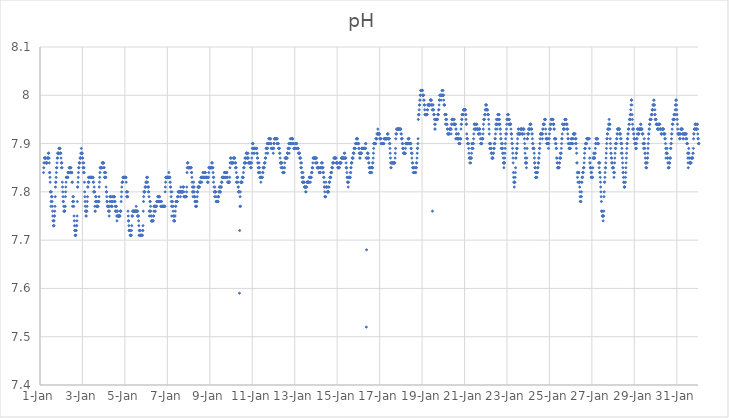
| Category | pH |
|---|---|
| 44927.166666666664 | 7.84 |
| 44927.177083333336 | 7.85 |
| 44927.1875 | 7.86 |
| 44927.197916666664 | 7.86 |
| 44927.208333333336 | 7.87 |
| 44927.21875 | 7.87 |
| 44927.229166666664 | 7.87 |
| 44927.239583333336 | 7.87 |
| 44927.25 | 7.87 |
| 44927.260416666664 | 7.87 |
| 44927.270833333336 | 7.87 |
| 44927.28125 | 7.86 |
| 44927.291666666664 | 7.86 |
| 44927.302083333336 | 7.86 |
| 44927.3125 | 7.86 |
| 44927.322916666664 | 7.86 |
| 44927.333333333336 | 7.86 |
| 44927.34375 | 7.87 |
| 44927.354166666664 | 7.87 |
| 44927.364583333336 | 7.87 |
| 44927.375 | 7.87 |
| 44927.385416666664 | 7.87 |
| 44927.395833333336 | 7.88 |
| 44927.40625 | 7.88 |
| 44927.416666666664 | 7.87 |
| 44927.427083333336 | 7.87 |
| 44927.4375 | 7.86 |
| 44927.447916666664 | 7.84 |
| 44927.458333333336 | 7.84 |
| 44927.46875 | 7.83 |
| 44927.479166666664 | 7.82 |
| 44927.489583333336 | 7.8 |
| 44927.5 | 7.8 |
| 44927.510416666664 | 7.77 |
| 44927.520833333336 | 7.78 |
| 44927.53125 | 7.8 |
| 44927.541666666664 | 7.79 |
| 44927.552083333336 | 7.79 |
| 44927.5625 | 7.79 |
| 44927.572916666664 | 7.78 |
| 44927.583333333336 | 7.77 |
| 44927.59375 | 7.76 |
| 44927.604166666664 | 7.75 |
| 44927.614583333336 | 7.74 |
| 44927.625 | 7.74 |
| 44927.635416666664 | 7.73 |
| 44927.645833333336 | 7.73 |
| 44927.65625 | 7.73 |
| 44927.666666666664 | 7.74 |
| 44927.677083333336 | 7.75 |
| 44927.6875 | 7.75 |
| 44927.697916666664 | 7.76 |
| 44927.708333333336 | 7.77 |
| 44927.71875 | 7.79 |
| 44927.729166666664 | 7.81 |
| 44927.739583333336 | 7.82 |
| 44927.75 | 7.82 |
| 44927.760416666664 | 7.83 |
| 44927.770833333336 | 7.84 |
| 44927.78125 | 7.85 |
| 44927.791666666664 | 7.85 |
| 44927.802083333336 | 7.86 |
| 44927.8125 | 7.87 |
| 44927.822916666664 | 7.87 |
| 44927.833333333336 | 7.88 |
| 44927.84375 | 7.88 |
| 44927.854166666664 | 7.88 |
| 44927.864583333336 | 7.88 |
| 44927.875 | 7.88 |
| 44927.885416666664 | 7.88 |
| 44927.895833333336 | 7.89 |
| 44927.90625 | 7.89 |
| 44927.916666666664 | 7.89 |
| 44927.927083333336 | 7.89 |
| 44927.9375 | 7.88 |
| 44927.947916666664 | 7.89 |
| 44927.958333333336 | 7.88 |
| 44927.96875 | 7.88 |
| 44927.979166666664 | 7.88 |
| 44927.989583333336 | 7.87 |
| 44928.0 | 7.86 |
| 44928.010416666664 | 7.85 |
| 44928.020833333336 | 7.86 |
| 44928.03125 | 7.86 |
| 44928.041666666664 | 7.85 |
| 44928.052083333336 | 7.82 |
| 44928.0625 | 7.81 |
| 44928.072916666664 | 7.8 |
| 44928.083333333336 | 7.79 |
| 44928.09375 | 7.78 |
| 44928.104166666664 | 7.78 |
| 44928.114583333336 | 7.77 |
| 44928.125 | 7.76 |
| 44928.135416666664 | 7.76 |
| 44928.145833333336 | 7.76 |
| 44928.15625 | 7.76 |
| 44928.166666666664 | 7.76 |
| 44928.177083333336 | 7.77 |
| 44928.1875 | 7.77 |
| 44928.197916666664 | 7.79 |
| 44928.208333333336 | 7.8 |
| 44928.21875 | 7.81 |
| 44928.229166666664 | 7.82 |
| 44928.239583333336 | 7.83 |
| 44928.25 | 7.83 |
| 44928.260416666664 | 7.83 |
| 44928.270833333336 | 7.83 |
| 44928.28125 | 7.83 |
| 44928.291666666664 | 7.83 |
| 44928.302083333336 | 7.83 |
| 44928.3125 | 7.83 |
| 44928.322916666664 | 7.84 |
| 44928.333333333336 | 7.84 |
| 44928.34375 | 7.84 |
| 44928.354166666664 | 7.84 |
| 44928.364583333336 | 7.84 |
| 44928.375 | 7.85 |
| 44928.385416666664 | 7.85 |
| 44928.395833333336 | 7.85 |
| 44928.40625 | 7.85 |
| 44928.416666666664 | 7.85 |
| 44928.427083333336 | 7.85 |
| 44928.4375 | 7.85 |
| 44928.447916666664 | 7.84 |
| 44928.458333333336 | 7.85 |
| 44928.46875 | 7.84 |
| 44928.479166666664 | 7.84 |
| 44928.489583333336 | 7.84 |
| 44928.5 | 7.84 |
| 44928.510416666664 | 7.82 |
| 44928.520833333336 | 7.82 |
| 44928.53125 | 7.77 |
| 44928.541666666664 | 7.78 |
| 44928.552083333336 | 7.79 |
| 44928.5625 | 7.78 |
| 44928.572916666664 | 7.79 |
| 44928.583333333336 | 7.78 |
| 44928.59375 | 7.77 |
| 44928.604166666664 | 7.75 |
| 44928.614583333336 | 7.74 |
| 44928.625 | 7.73 |
| 44928.635416666664 | 7.72 |
| 44928.645833333336 | 7.72 |
| 44928.65625 | 7.71 |
| 44928.666666666664 | 7.71 |
| 44928.677083333336 | 7.71 |
| 44928.6875 | 7.71 |
| 44928.697916666664 | 7.72 |
| 44928.708333333336 | 7.72 |
| 44928.71875 | 7.73 |
| 44928.729166666664 | 7.73 |
| 44928.739583333336 | 7.74 |
| 44928.75 | 7.75 |
| 44928.760416666664 | 7.78 |
| 44928.770833333336 | 7.81 |
| 44928.78125 | 7.81 |
| 44928.791666666664 | 7.82 |
| 44928.802083333336 | 7.83 |
| 44928.8125 | 7.84 |
| 44928.822916666664 | 7.85 |
| 44928.833333333336 | 7.85 |
| 44928.84375 | 7.86 |
| 44928.854166666664 | 7.86 |
| 44928.864583333336 | 7.86 |
| 44928.875 | 7.86 |
| 44928.885416666664 | 7.87 |
| 44928.895833333336 | 7.87 |
| 44928.90625 | 7.87 |
| 44928.916666666664 | 7.87 |
| 44928.927083333336 | 7.88 |
| 44928.9375 | 7.88 |
| 44928.947916666664 | 7.89 |
| 44928.958333333336 | 7.88 |
| 44928.96875 | 7.88 |
| 44928.979166666664 | 7.88 |
| 44928.989583333336 | 7.88 |
| 44929.0 | 7.87 |
| 44929.010416666664 | 7.87 |
| 44929.020833333336 | 7.86 |
| 44929.03125 | 7.85 |
| 44929.041666666664 | 7.85 |
| 44929.052083333336 | 7.84 |
| 44929.0625 | 7.86 |
| 44929.072916666664 | 7.85 |
| 44929.083333333336 | 7.84 |
| 44929.09375 | 7.82 |
| 44929.104166666664 | 7.8 |
| 44929.114583333336 | 7.79 |
| 44929.125 | 7.78 |
| 44929.135416666664 | 7.77 |
| 44929.145833333336 | 7.76 |
| 44929.15625 | 7.76 |
| 44929.166666666664 | 7.75 |
| 44929.177083333336 | 7.75 |
| 44929.1875 | 7.76 |
| 44929.197916666664 | 7.76 |
| 44929.208333333336 | 7.76 |
| 44929.21875 | 7.77 |
| 44929.229166666664 | 7.78 |
| 44929.239583333336 | 7.79 |
| 44929.25 | 7.81 |
| 44929.260416666664 | 7.81 |
| 44929.270833333336 | 7.82 |
| 44929.28125 | 7.83 |
| 44929.291666666664 | 7.82 |
| 44929.302083333336 | 7.82 |
| 44929.3125 | 7.83 |
| 44929.322916666664 | 7.83 |
| 44929.333333333336 | 7.83 |
| 44929.34375 | 7.83 |
| 44929.354166666664 | 7.83 |
| 44929.364583333336 | 7.83 |
| 44929.375 | 7.83 |
| 44929.385416666664 | 7.83 |
| 44929.395833333336 | 7.83 |
| 44929.40625 | 7.83 |
| 44929.416666666664 | 7.83 |
| 44929.427083333336 | 7.83 |
| 44929.4375 | 7.83 |
| 44929.447916666664 | 7.83 |
| 44929.458333333336 | 7.83 |
| 44929.46875 | 7.83 |
| 44929.479166666664 | 7.83 |
| 44929.489583333336 | 7.83 |
| 44929.5 | 7.83 |
| 44929.510416666664 | 7.82 |
| 44929.520833333336 | 7.82 |
| 44929.53125 | 7.8 |
| 44929.541666666664 | 7.8 |
| 44929.552083333336 | 7.81 |
| 44929.5625 | 7.8 |
| 44929.572916666664 | 7.8 |
| 44929.583333333336 | 7.77 |
| 44929.59375 | 7.76 |
| 44929.604166666664 | 7.76 |
| 44929.614583333336 | 7.78 |
| 44929.625 | 7.79 |
| 44929.635416666664 | 7.79 |
| 44929.645833333336 | 7.78 |
| 44929.65625 | 7.78 |
| 44929.666666666664 | 7.77 |
| 44929.677083333336 | 7.77 |
| 44929.6875 | 7.77 |
| 44929.697916666664 | 7.77 |
| 44929.708333333336 | 7.77 |
| 44929.71875 | 7.77 |
| 44929.729166666664 | 7.77 |
| 44929.739583333336 | 7.78 |
| 44929.75 | 7.78 |
| 44929.760416666664 | 7.78 |
| 44929.770833333336 | 7.78 |
| 44929.78125 | 7.79 |
| 44929.791666666664 | 7.81 |
| 44929.802083333336 | 7.82 |
| 44929.8125 | 7.83 |
| 44929.822916666664 | 7.84 |
| 44929.833333333336 | 7.85 |
| 44929.84375 | 7.85 |
| 44929.854166666664 | 7.85 |
| 44929.864583333336 | 7.85 |
| 44929.875 | 7.85 |
| 44929.885416666664 | 7.85 |
| 44929.895833333336 | 7.85 |
| 44929.90625 | 7.85 |
| 44929.916666666664 | 7.85 |
| 44929.927083333336 | 7.86 |
| 44929.9375 | 7.86 |
| 44929.947916666664 | 7.86 |
| 44929.958333333336 | 7.86 |
| 44929.96875 | 7.86 |
| 44929.979166666664 | 7.86 |
| 44929.989583333336 | 7.86 |
| 44930.0 | 7.86 |
| 44930.010416666664 | 7.85 |
| 44930.020833333336 | 7.85 |
| 44930.03125 | 7.84 |
| 44930.041666666664 | 7.83 |
| 44930.052083333336 | 7.83 |
| 44930.0625 | 7.84 |
| 44930.072916666664 | 7.83 |
| 44930.083333333336 | 7.83 |
| 44930.09375 | 7.84 |
| 44930.104166666664 | 7.83 |
| 44930.114583333336 | 7.81 |
| 44930.125 | 7.8 |
| 44930.135416666664 | 7.8 |
| 44930.145833333336 | 7.79 |
| 44930.15625 | 7.78 |
| 44930.166666666664 | 7.78 |
| 44930.177083333336 | 7.77 |
| 44930.1875 | 7.77 |
| 44930.197916666664 | 7.77 |
| 44930.208333333336 | 7.77 |
| 44930.21875 | 7.77 |
| 44930.229166666664 | 7.76 |
| 44930.239583333336 | 7.76 |
| 44930.25 | 7.76 |
| 44930.260416666664 | 7.75 |
| 44930.270833333336 | 7.76 |
| 44930.28125 | 7.77 |
| 44930.291666666664 | 7.78 |
| 44930.302083333336 | 7.79 |
| 44930.3125 | 7.79 |
| 44930.322916666664 | 7.79 |
| 44930.333333333336 | 7.79 |
| 44930.34375 | 7.79 |
| 44930.354166666664 | 7.78 |
| 44930.364583333336 | 7.77 |
| 44930.375 | 7.77 |
| 44930.385416666664 | 7.77 |
| 44930.395833333336 | 7.77 |
| 44930.40625 | 7.78 |
| 44930.416666666664 | 7.78 |
| 44930.427083333336 | 7.78 |
| 44930.4375 | 7.79 |
| 44930.447916666664 | 7.79 |
| 44930.458333333336 | 7.79 |
| 44930.46875 | 7.79 |
| 44930.479166666664 | 7.79 |
| 44930.489583333336 | 7.79 |
| 44930.5 | 7.79 |
| 44930.510416666664 | 7.79 |
| 44930.520833333336 | 7.78 |
| 44930.53125 | 7.78 |
| 44930.541666666664 | 7.77 |
| 44930.552083333336 | 7.76 |
| 44930.5625 | 7.76 |
| 44930.572916666664 | 7.77 |
| 44930.583333333336 | 7.77 |
| 44930.59375 | 7.77 |
| 44930.604166666664 | 7.76 |
| 44930.614583333336 | 7.75 |
| 44930.625 | 7.74 |
| 44930.635416666664 | 7.76 |
| 44930.645833333336 | 7.76 |
| 44930.65625 | 7.75 |
| 44930.666666666664 | 7.75 |
| 44930.677083333336 | 7.75 |
| 44930.6875 | 7.75 |
| 44930.697916666664 | 7.75 |
| 44930.708333333336 | 7.75 |
| 44930.71875 | 7.75 |
| 44930.729166666664 | 7.75 |
| 44930.739583333336 | 7.75 |
| 44930.75 | 7.75 |
| 44930.760416666664 | 7.75 |
| 44930.770833333336 | 7.75 |
| 44930.78125 | 7.76 |
| 44930.791666666664 | 7.76 |
| 44930.802083333336 | 7.76 |
| 44930.8125 | 7.76 |
| 44930.822916666664 | 7.78 |
| 44930.833333333336 | 7.79 |
| 44930.84375 | 7.8 |
| 44930.854166666664 | 7.81 |
| 44930.864583333336 | 7.82 |
| 44930.875 | 7.82 |
| 44930.885416666664 | 7.82 |
| 44930.895833333336 | 7.82 |
| 44930.90625 | 7.83 |
| 44930.916666666664 | 7.83 |
| 44930.927083333336 | 7.83 |
| 44930.9375 | 7.83 |
| 44930.947916666664 | 7.83 |
| 44930.958333333336 | 7.83 |
| 44930.96875 | 7.83 |
| 44930.979166666664 | 7.83 |
| 44930.989583333336 | 7.83 |
| 44931.0 | 7.83 |
| 44931.010416666664 | 7.83 |
| 44931.020833333336 | 7.83 |
| 44931.03125 | 7.83 |
| 44931.041666666664 | 7.83 |
| 44931.052083333336 | 7.83 |
| 44931.0625 | 7.82 |
| 44931.072916666664 | 7.8 |
| 44931.083333333336 | 7.79 |
| 44931.09375 | 7.8 |
| 44931.104166666664 | 7.79 |
| 44931.114583333336 | 7.79 |
| 44931.125 | 7.8 |
| 44931.135416666664 | 7.79 |
| 44931.145833333336 | 7.76 |
| 44931.15625 | 7.75 |
| 44931.166666666664 | 7.74 |
| 44931.177083333336 | 7.74 |
| 44931.1875 | 7.73 |
| 44931.197916666664 | 7.72 |
| 44931.208333333336 | 7.72 |
| 44931.21875 | 7.72 |
| 44931.229166666664 | 7.72 |
| 44931.239583333336 | 7.72 |
| 44931.25 | 7.71 |
| 44931.260416666664 | 7.71 |
| 44931.270833333336 | 7.71 |
| 44931.28125 | 7.71 |
| 44931.291666666664 | 7.71 |
| 44931.302083333336 | 7.71 |
| 44931.3125 | 7.72 |
| 44931.322916666664 | 7.73 |
| 44931.333333333336 | 7.75 |
| 44931.34375 | 7.75 |
| 44931.354166666664 | 7.75 |
| 44931.364583333336 | 7.76 |
| 44931.375 | 7.76 |
| 44931.385416666664 | 7.76 |
| 44931.395833333336 | 7.76 |
| 44931.40625 | 7.76 |
| 44931.416666666664 | 7.76 |
| 44931.427083333336 | 7.76 |
| 44931.4375 | 7.76 |
| 44931.447916666664 | 7.76 |
| 44931.458333333336 | 7.76 |
| 44931.46875 | 7.76 |
| 44931.479166666664 | 7.76 |
| 44931.489583333336 | 7.76 |
| 44931.5 | 7.76 |
| 44931.510416666664 | 7.76 |
| 44931.520833333336 | 7.76 |
| 44931.53125 | 7.77 |
| 44931.541666666664 | 7.76 |
| 44931.552083333336 | 7.76 |
| 44931.5625 | 7.76 |
| 44931.572916666664 | 7.76 |
| 44931.583333333336 | 7.76 |
| 44931.59375 | 7.75 |
| 44931.604166666664 | 7.76 |
| 44931.614583333336 | 7.75 |
| 44931.625 | 7.75 |
| 44931.635416666664 | 7.75 |
| 44931.645833333336 | 7.74 |
| 44931.65625 | 7.73 |
| 44931.666666666664 | 7.71 |
| 44931.677083333336 | 7.72 |
| 44931.6875 | 7.71 |
| 44931.697916666664 | 7.72 |
| 44931.708333333336 | 7.72 |
| 44931.71875 | 7.71 |
| 44931.729166666664 | 7.71 |
| 44931.739583333336 | 7.71 |
| 44931.75 | 7.71 |
| 44931.760416666664 | 7.71 |
| 44931.770833333336 | 7.71 |
| 44931.78125 | 7.71 |
| 44931.791666666664 | 7.71 |
| 44931.802083333336 | 7.71 |
| 44931.8125 | 7.71 |
| 44931.822916666664 | 7.71 |
| 44931.833333333336 | 7.72 |
| 44931.84375 | 7.72 |
| 44931.854166666664 | 7.73 |
| 44931.864583333336 | 7.76 |
| 44931.875 | 7.78 |
| 44931.885416666664 | 7.79 |
| 44931.895833333336 | 7.8 |
| 44931.90625 | 7.8 |
| 44931.916666666664 | 7.8 |
| 44931.927083333336 | 7.8 |
| 44931.9375 | 7.8 |
| 44931.947916666664 | 7.81 |
| 44931.958333333336 | 7.81 |
| 44931.96875 | 7.81 |
| 44931.979166666664 | 7.81 |
| 44931.989583333336 | 7.82 |
| 44932.0 | 7.82 |
| 44932.010416666664 | 7.82 |
| 44932.020833333336 | 7.82 |
| 44932.03125 | 7.83 |
| 44932.041666666664 | 7.83 |
| 44932.052083333336 | 7.83 |
| 44932.0625 | 7.83 |
| 44932.072916666664 | 7.82 |
| 44932.083333333336 | 7.81 |
| 44932.09375 | 7.81 |
| 44932.104166666664 | 7.8 |
| 44932.114583333336 | 7.81 |
| 44932.125 | 7.8 |
| 44932.135416666664 | 7.79 |
| 44932.145833333336 | 7.76 |
| 44932.15625 | 7.75 |
| 44932.166666666664 | 7.76 |
| 44932.177083333336 | 7.78 |
| 44932.1875 | 7.76 |
| 44932.197916666664 | 7.78 |
| 44932.208333333336 | 7.77 |
| 44932.21875 | 7.76 |
| 44932.229166666664 | 7.75 |
| 44932.239583333336 | 7.75 |
| 44932.25 | 7.74 |
| 44932.260416666664 | 7.74 |
| 44932.270833333336 | 7.74 |
| 44932.28125 | 7.74 |
| 44932.291666666664 | 7.74 |
| 44932.302083333336 | 7.74 |
| 44932.3125 | 7.74 |
| 44932.322916666664 | 7.74 |
| 44932.333333333336 | 7.74 |
| 44932.34375 | 7.75 |
| 44932.354166666664 | 7.75 |
| 44932.364583333336 | 7.76 |
| 44932.375 | 7.77 |
| 44932.385416666664 | 7.77 |
| 44932.395833333336 | 7.77 |
| 44932.40625 | 7.77 |
| 44932.416666666664 | 7.76 |
| 44932.427083333336 | 7.76 |
| 44932.4375 | 7.77 |
| 44932.447916666664 | 7.77 |
| 44932.458333333336 | 7.77 |
| 44932.46875 | 7.77 |
| 44932.479166666664 | 7.77 |
| 44932.489583333336 | 7.77 |
| 44932.5 | 7.78 |
| 44932.510416666664 | 7.78 |
| 44932.520833333336 | 7.78 |
| 44932.53125 | 7.78 |
| 44932.541666666664 | 7.78 |
| 44932.552083333336 | 7.79 |
| 44932.5625 | 7.79 |
| 44932.572916666664 | 7.79 |
| 44932.583333333336 | 7.79 |
| 44932.59375 | 7.78 |
| 44932.604166666664 | 7.79 |
| 44932.614583333336 | 7.79 |
| 44932.625 | 7.79 |
| 44932.635416666664 | 7.79 |
| 44932.645833333336 | 7.78 |
| 44932.65625 | 7.78 |
| 44932.666666666664 | 7.78 |
| 44932.677083333336 | 7.78 |
| 44932.6875 | 7.77 |
| 44932.697916666664 | 7.77 |
| 44932.708333333336 | 7.78 |
| 44932.71875 | 7.77 |
| 44932.729166666664 | 7.78 |
| 44932.739583333336 | 7.77 |
| 44932.75 | 7.77 |
| 44932.760416666664 | 7.77 |
| 44932.770833333336 | 7.77 |
| 44932.78125 | 7.77 |
| 44932.791666666664 | 7.77 |
| 44932.802083333336 | 7.77 |
| 44932.8125 | 7.77 |
| 44932.822916666664 | 7.77 |
| 44932.833333333336 | 7.77 |
| 44932.84375 | 7.77 |
| 44932.854166666664 | 7.77 |
| 44932.864583333336 | 7.77 |
| 44932.875 | 7.77 |
| 44932.885416666664 | 7.77 |
| 44932.895833333336 | 7.8 |
| 44932.90625 | 7.81 |
| 44932.916666666664 | 7.82 |
| 44932.927083333336 | 7.83 |
| 44932.9375 | 7.83 |
| 44932.947916666664 | 7.83 |
| 44932.958333333336 | 7.83 |
| 44932.96875 | 7.83 |
| 44932.979166666664 | 7.83 |
| 44932.989583333336 | 7.83 |
| 44933.0 | 7.83 |
| 44933.010416666664 | 7.83 |
| 44933.020833333336 | 7.83 |
| 44933.03125 | 7.83 |
| 44933.041666666664 | 7.83 |
| 44933.052083333336 | 7.83 |
| 44933.0625 | 7.83 |
| 44933.072916666664 | 7.84 |
| 44933.083333333336 | 7.83 |
| 44933.09375 | 7.83 |
| 44933.104166666664 | 7.83 |
| 44933.114583333336 | 7.83 |
| 44933.125 | 7.82 |
| 44933.135416666664 | 7.82 |
| 44933.145833333336 | 7.81 |
| 44933.15625 | 7.81 |
| 44933.166666666664 | 7.8 |
| 44933.177083333336 | 7.79 |
| 44933.1875 | 7.78 |
| 44933.197916666664 | 7.77 |
| 44933.208333333336 | 7.75 |
| 44933.21875 | 7.8 |
| 44933.229166666664 | 7.78 |
| 44933.239583333336 | 7.78 |
| 44933.25 | 7.77 |
| 44933.260416666664 | 7.77 |
| 44933.270833333336 | 7.76 |
| 44933.28125 | 7.75 |
| 44933.291666666664 | 7.75 |
| 44933.302083333336 | 7.74 |
| 44933.3125 | 7.74 |
| 44933.322916666664 | 7.74 |
| 44933.333333333336 | 7.74 |
| 44933.34375 | 7.74 |
| 44933.354166666664 | 7.75 |
| 44933.364583333336 | 7.75 |
| 44933.375 | 7.76 |
| 44933.385416666664 | 7.77 |
| 44933.395833333336 | 7.77 |
| 44933.40625 | 7.78 |
| 44933.416666666664 | 7.78 |
| 44933.427083333336 | 7.78 |
| 44933.4375 | 7.78 |
| 44933.447916666664 | 7.78 |
| 44933.458333333336 | 7.78 |
| 44933.46875 | 7.78 |
| 44933.479166666664 | 7.79 |
| 44933.489583333336 | 7.79 |
| 44933.5 | 7.79 |
| 44933.510416666664 | 7.8 |
| 44933.520833333336 | 7.8 |
| 44933.53125 | 7.8 |
| 44933.541666666664 | 7.8 |
| 44933.552083333336 | 7.8 |
| 44933.5625 | 7.8 |
| 44933.572916666664 | 7.8 |
| 44933.583333333336 | 7.8 |
| 44933.59375 | 7.8 |
| 44933.604166666664 | 7.8 |
| 44933.614583333336 | 7.79 |
| 44933.625 | 7.8 |
| 44933.635416666664 | 7.81 |
| 44933.645833333336 | 7.8 |
| 44933.65625 | 7.8 |
| 44933.666666666664 | 7.8 |
| 44933.677083333336 | 7.8 |
| 44933.6875 | 7.8 |
| 44933.697916666664 | 7.8 |
| 44933.708333333336 | 7.8 |
| 44933.71875 | 7.8 |
| 44933.729166666664 | 7.8 |
| 44933.739583333336 | 7.81 |
| 44933.75 | 7.81 |
| 44933.760416666664 | 7.81 |
| 44933.770833333336 | 7.8 |
| 44933.78125 | 7.79 |
| 44933.791666666664 | 7.79 |
| 44933.802083333336 | 7.79 |
| 44933.8125 | 7.79 |
| 44933.822916666664 | 7.79 |
| 44933.833333333336 | 7.79 |
| 44933.84375 | 7.79 |
| 44933.854166666664 | 7.79 |
| 44933.864583333336 | 7.79 |
| 44933.875 | 7.79 |
| 44933.885416666664 | 7.79 |
| 44933.895833333336 | 7.79 |
| 44933.90625 | 7.8 |
| 44933.916666666664 | 7.81 |
| 44933.927083333336 | 7.84 |
| 44933.9375 | 7.85 |
| 44933.947916666664 | 7.86 |
| 44933.958333333336 | 7.86 |
| 44933.96875 | 7.86 |
| 44933.979166666664 | 7.85 |
| 44933.989583333336 | 7.85 |
| 44934.0 | 7.85 |
| 44934.010416666664 | 7.85 |
| 44934.020833333336 | 7.85 |
| 44934.03125 | 7.85 |
| 44934.041666666664 | 7.85 |
| 44934.052083333336 | 7.85 |
| 44934.0625 | 7.85 |
| 44934.072916666664 | 7.85 |
| 44934.083333333336 | 7.85 |
| 44934.09375 | 7.85 |
| 44934.104166666664 | 7.85 |
| 44934.114583333336 | 7.85 |
| 44934.125 | 7.85 |
| 44934.135416666664 | 7.84 |
| 44934.145833333336 | 7.84 |
| 44934.15625 | 7.83 |
| 44934.166666666664 | 7.82 |
| 44934.177083333336 | 7.81 |
| 44934.1875 | 7.8 |
| 44934.197916666664 | 7.8 |
| 44934.208333333336 | 7.79 |
| 44934.21875 | 7.81 |
| 44934.229166666664 | 7.8 |
| 44934.239583333336 | 7.82 |
| 44934.25 | 7.81 |
| 44934.260416666664 | 7.81 |
| 44934.270833333336 | 7.8 |
| 44934.28125 | 7.79 |
| 44934.291666666664 | 7.79 |
| 44934.302083333336 | 7.78 |
| 44934.3125 | 7.78 |
| 44934.322916666664 | 7.78 |
| 44934.333333333336 | 7.77 |
| 44934.34375 | 7.77 |
| 44934.354166666664 | 7.77 |
| 44934.364583333336 | 7.77 |
| 44934.375 | 7.77 |
| 44934.385416666664 | 7.78 |
| 44934.395833333336 | 7.78 |
| 44934.40625 | 7.79 |
| 44934.416666666664 | 7.8 |
| 44934.427083333336 | 7.8 |
| 44934.4375 | 7.81 |
| 44934.447916666664 | 7.81 |
| 44934.458333333336 | 7.81 |
| 44934.46875 | 7.81 |
| 44934.479166666664 | 7.81 |
| 44934.489583333336 | 7.81 |
| 44934.5 | 7.81 |
| 44934.510416666664 | 7.81 |
| 44934.520833333336 | 7.82 |
| 44934.53125 | 7.82 |
| 44934.541666666664 | 7.82 |
| 44934.552083333336 | 7.82 |
| 44934.5625 | 7.82 |
| 44934.572916666664 | 7.82 |
| 44934.583333333336 | 7.83 |
| 44934.59375 | 7.83 |
| 44934.604166666664 | 7.83 |
| 44934.614583333336 | 7.83 |
| 44934.625 | 7.82 |
| 44934.635416666664 | 7.83 |
| 44934.645833333336 | 7.83 |
| 44934.65625 | 7.83 |
| 44934.666666666664 | 7.83 |
| 44934.677083333336 | 7.84 |
| 44934.6875 | 7.83 |
| 44934.697916666664 | 7.84 |
| 44934.708333333336 | 7.83 |
| 44934.71875 | 7.83 |
| 44934.729166666664 | 7.83 |
| 44934.739583333336 | 7.83 |
| 44934.75 | 7.83 |
| 44934.760416666664 | 7.83 |
| 44934.770833333336 | 7.84 |
| 44934.78125 | 7.84 |
| 44934.791666666664 | 7.84 |
| 44934.802083333336 | 7.83 |
| 44934.8125 | 7.83 |
| 44934.822916666664 | 7.83 |
| 44934.833333333336 | 7.83 |
| 44934.84375 | 7.83 |
| 44934.854166666664 | 7.83 |
| 44934.864583333336 | 7.83 |
| 44934.875 | 7.83 |
| 44934.885416666664 | 7.83 |
| 44934.895833333336 | 7.82 |
| 44934.90625 | 7.82 |
| 44934.916666666664 | 7.82 |
| 44934.927083333336 | 7.83 |
| 44934.9375 | 7.83 |
| 44934.947916666664 | 7.84 |
| 44934.958333333336 | 7.85 |
| 44934.96875 | 7.85 |
| 44934.979166666664 | 7.85 |
| 44934.989583333336 | 7.85 |
| 44935.0 | 7.85 |
| 44935.010416666664 | 7.85 |
| 44935.020833333336 | 7.85 |
| 44935.03125 | 7.85 |
| 44935.041666666664 | 7.85 |
| 44935.052083333336 | 7.85 |
| 44935.0625 | 7.85 |
| 44935.072916666664 | 7.85 |
| 44935.083333333336 | 7.85 |
| 44935.09375 | 7.86 |
| 44935.104166666664 | 7.86 |
| 44935.114583333336 | 7.86 |
| 44935.125 | 7.85 |
| 44935.135416666664 | 7.85 |
| 44935.145833333336 | 7.85 |
| 44935.15625 | 7.84 |
| 44935.166666666664 | 7.83 |
| 44935.177083333336 | 7.82 |
| 44935.1875 | 7.83 |
| 44935.197916666664 | 7.81 |
| 44935.208333333336 | 7.8 |
| 44935.21875 | 7.8 |
| 44935.229166666664 | 7.79 |
| 44935.239583333336 | 7.81 |
| 44935.25 | 7.8 |
| 44935.260416666664 | 7.8 |
| 44935.270833333336 | 7.8 |
| 44935.28125 | 7.8 |
| 44935.291666666664 | 7.79 |
| 44935.302083333336 | 7.78 |
| 44935.3125 | 7.78 |
| 44935.322916666664 | 7.78 |
| 44935.333333333336 | 7.78 |
| 44935.34375 | 7.78 |
| 44935.354166666664 | 7.78 |
| 44935.364583333336 | 7.78 |
| 44935.375 | 7.78 |
| 44935.385416666664 | 7.78 |
| 44935.395833333336 | 7.79 |
| 44935.40625 | 7.79 |
| 44935.416666666664 | 7.79 |
| 44935.427083333336 | 7.8 |
| 44935.4375 | 7.8 |
| 44935.447916666664 | 7.81 |
| 44935.458333333336 | 7.81 |
| 44935.46875 | 7.8 |
| 44935.479166666664 | 7.8 |
| 44935.489583333336 | 7.8 |
| 44935.5 | 7.8 |
| 44935.510416666664 | 7.81 |
| 44935.520833333336 | 7.81 |
| 44935.53125 | 7.81 |
| 44935.541666666664 | 7.81 |
| 44935.552083333336 | 7.82 |
| 44935.5625 | 7.82 |
| 44935.572916666664 | 7.82 |
| 44935.583333333336 | 7.83 |
| 44935.59375 | 7.83 |
| 44935.604166666664 | 7.83 |
| 44935.614583333336 | 7.83 |
| 44935.625 | 7.83 |
| 44935.635416666664 | 7.83 |
| 44935.645833333336 | 7.83 |
| 44935.65625 | 7.83 |
| 44935.666666666664 | 7.83 |
| 44935.677083333336 | 7.83 |
| 44935.6875 | 7.84 |
| 44935.697916666664 | 7.84 |
| 44935.708333333336 | 7.84 |
| 44935.71875 | 7.84 |
| 44935.729166666664 | 7.83 |
| 44935.739583333336 | 7.83 |
| 44935.75 | 7.83 |
| 44935.760416666664 | 7.84 |
| 44935.770833333336 | 7.84 |
| 44935.78125 | 7.84 |
| 44935.791666666664 | 7.84 |
| 44935.802083333336 | 7.84 |
| 44935.8125 | 7.83 |
| 44935.822916666664 | 7.83 |
| 44935.833333333336 | 7.83 |
| 44935.84375 | 7.82 |
| 44935.854166666664 | 7.82 |
| 44935.864583333336 | 7.82 |
| 44935.875 | 7.82 |
| 44935.885416666664 | 7.82 |
| 44935.895833333336 | 7.82 |
| 44935.90625 | 7.82 |
| 44935.916666666664 | 7.82 |
| 44935.927083333336 | 7.82 |
| 44935.9375 | 7.83 |
| 44935.947916666664 | 7.85 |
| 44935.958333333336 | 7.86 |
| 44935.96875 | 7.86 |
| 44935.979166666664 | 7.87 |
| 44935.989583333336 | 7.87 |
| 44936.0 | 7.87 |
| 44936.010416666664 | 7.86 |
| 44936.020833333336 | 7.86 |
| 44936.03125 | 7.86 |
| 44936.041666666664 | 7.86 |
| 44936.052083333336 | 7.86 |
| 44936.0625 | 7.86 |
| 44936.072916666664 | 7.86 |
| 44936.083333333336 | 7.86 |
| 44936.09375 | 7.86 |
| 44936.104166666664 | 7.86 |
| 44936.114583333336 | 7.87 |
| 44936.125 | 7.87 |
| 44936.135416666664 | 7.87 |
| 44936.145833333336 | 7.87 |
| 44936.15625 | 7.87 |
| 44936.166666666664 | 7.87 |
| 44936.177083333336 | 7.87 |
| 44936.1875 | 7.86 |
| 44936.197916666664 | 7.86 |
| 44936.208333333336 | 7.85 |
| 44936.21875 | 7.86 |
| 44936.229166666664 | 7.85 |
| 44936.239583333336 | 7.85 |
| 44936.25 | 7.84 |
| 44936.260416666664 | 7.82 |
| 44936.270833333336 | 7.82 |
| 44936.28125 | 7.83 |
| 44936.291666666664 | 7.83 |
| 44936.302083333336 | 7.83 |
| 44936.3125 | 7.83 |
| 44936.322916666664 | 7.82 |
| 44936.333333333336 | 7.81 |
| 44936.34375 | 7.81 |
| 44936.354166666664 | 7.8 |
| 44936.364583333336 | 7.8 |
| 44936.375 | 7.8 |
| 44936.385416666664 | 7.8 |
| 44936.395833333336 | 7.59 |
| 44936.40625 | 7.72 |
| 44936.416666666664 | 7.77 |
| 44936.427083333336 | 7.79 |
| 44936.4375 | 7.8 |
| 44936.447916666664 | 7.77 |
| 44936.458333333336 | 7.82 |
| 44936.46875 | 7.82 |
| 44936.479166666664 | 7.82 |
| 44936.489583333336 | 7.82 |
| 44936.5 | 7.82 |
| 44936.510416666664 | 7.82 |
| 44936.520833333336 | 7.82 |
| 44936.53125 | 7.83 |
| 44936.541666666664 | 7.83 |
| 44936.552083333336 | 7.83 |
| 44936.5625 | 7.83 |
| 44936.572916666664 | 7.83 |
| 44936.583333333336 | 7.84 |
| 44936.59375 | 7.85 |
| 44936.604166666664 | 7.85 |
| 44936.614583333336 | 7.85 |
| 44936.625 | 7.86 |
| 44936.635416666664 | 7.86 |
| 44936.645833333336 | 7.86 |
| 44936.65625 | 7.87 |
| 44936.666666666664 | 7.87 |
| 44936.677083333336 | 7.86 |
| 44936.6875 | 7.86 |
| 44936.697916666664 | 7.87 |
| 44936.708333333336 | 7.87 |
| 44936.71875 | 7.88 |
| 44936.729166666664 | 7.88 |
| 44936.739583333336 | 7.88 |
| 44936.75 | 7.88 |
| 44936.760416666664 | 7.88 |
| 44936.770833333336 | 7.87 |
| 44936.78125 | 7.87 |
| 44936.791666666664 | 7.87 |
| 44936.802083333336 | 7.88 |
| 44936.8125 | 7.87 |
| 44936.822916666664 | 7.86 |
| 44936.833333333336 | 7.86 |
| 44936.84375 | 7.86 |
| 44936.854166666664 | 7.86 |
| 44936.864583333336 | 7.86 |
| 44936.875 | 7.86 |
| 44936.885416666664 | 7.86 |
| 44936.895833333336 | 7.86 |
| 44936.90625 | 7.86 |
| 44936.916666666664 | 7.86 |
| 44936.927083333336 | 7.85 |
| 44936.9375 | 7.85 |
| 44936.947916666664 | 7.85 |
| 44936.958333333336 | 7.86 |
| 44936.96875 | 7.86 |
| 44936.979166666664 | 7.87 |
| 44936.989583333336 | 7.88 |
| 44937.0 | 7.89 |
| 44937.010416666664 | 7.9 |
| 44937.020833333336 | 7.9 |
| 44937.03125 | 7.9 |
| 44937.041666666664 | 7.89 |
| 44937.052083333336 | 7.89 |
| 44937.0625 | 7.89 |
| 44937.072916666664 | 7.89 |
| 44937.083333333336 | 7.88 |
| 44937.09375 | 7.88 |
| 44937.104166666664 | 7.89 |
| 44937.114583333336 | 7.89 |
| 44937.125 | 7.89 |
| 44937.135416666664 | 7.89 |
| 44937.145833333336 | 7.89 |
| 44937.15625 | 7.89 |
| 44937.166666666664 | 7.89 |
| 44937.177083333336 | 7.89 |
| 44937.1875 | 7.89 |
| 44937.197916666664 | 7.89 |
| 44937.208333333336 | 7.89 |
| 44937.21875 | 7.88 |
| 44937.229166666664 | 7.88 |
| 44937.239583333336 | 7.87 |
| 44937.25 | 7.87 |
| 44937.260416666664 | 7.86 |
| 44937.270833333336 | 7.86 |
| 44937.28125 | 7.85 |
| 44937.291666666664 | 7.84 |
| 44937.302083333336 | 7.84 |
| 44937.3125 | 7.85 |
| 44937.322916666664 | 7.86 |
| 44937.333333333336 | 7.85 |
| 44937.34375 | 7.84 |
| 44937.354166666664 | 7.84 |
| 44937.364583333336 | 7.83 |
| 44937.375 | 7.83 |
| 44937.385416666664 | 7.83 |
| 44937.395833333336 | 7.83 |
| 44937.40625 | 7.82 |
| 44937.416666666664 | 7.83 |
| 44937.427083333336 | 7.83 |
| 44937.4375 | 7.83 |
| 44937.447916666664 | 7.83 |
| 44937.458333333336 | 7.83 |
| 44937.46875 | 7.83 |
| 44937.479166666664 | 7.83 |
| 44937.489583333336 | 7.84 |
| 44937.5 | 7.84 |
| 44937.510416666664 | 7.85 |
| 44937.520833333336 | 7.85 |
| 44937.53125 | 7.85 |
| 44937.541666666664 | 7.85 |
| 44937.552083333336 | 7.85 |
| 44937.5625 | 7.85 |
| 44937.572916666664 | 7.86 |
| 44937.583333333336 | 7.86 |
| 44937.59375 | 7.86 |
| 44937.604166666664 | 7.86 |
| 44937.614583333336 | 7.87 |
| 44937.625 | 7.87 |
| 44937.635416666664 | 7.87 |
| 44937.645833333336 | 7.88 |
| 44937.65625 | 7.89 |
| 44937.666666666664 | 7.89 |
| 44937.677083333336 | 7.89 |
| 44937.6875 | 7.89 |
| 44937.697916666664 | 7.9 |
| 44937.708333333336 | 7.89 |
| 44937.71875 | 7.89 |
| 44937.729166666664 | 7.88 |
| 44937.739583333336 | 7.9 |
| 44937.75 | 7.9 |
| 44937.760416666664 | 7.9 |
| 44937.770833333336 | 7.9 |
| 44937.78125 | 7.91 |
| 44937.791666666664 | 7.91 |
| 44937.802083333336 | 7.91 |
| 44937.8125 | 7.9 |
| 44937.822916666664 | 7.91 |
| 44937.833333333336 | 7.91 |
| 44937.84375 | 7.91 |
| 44937.854166666664 | 7.91 |
| 44937.864583333336 | 7.91 |
| 44937.875 | 7.9 |
| 44937.885416666664 | 7.9 |
| 44937.895833333336 | 7.89 |
| 44937.90625 | 7.89 |
| 44937.916666666664 | 7.89 |
| 44937.927083333336 | 7.89 |
| 44937.9375 | 7.89 |
| 44937.947916666664 | 7.89 |
| 44937.958333333336 | 7.89 |
| 44937.96875 | 7.89 |
| 44937.979166666664 | 7.89 |
| 44937.989583333336 | 7.88 |
| 44938.0 | 7.89 |
| 44938.010416666664 | 7.89 |
| 44938.020833333336 | 7.9 |
| 44938.03125 | 7.9 |
| 44938.041666666664 | 7.91 |
| 44938.052083333336 | 7.91 |
| 44938.0625 | 7.91 |
| 44938.072916666664 | 7.91 |
| 44938.083333333336 | 7.91 |
| 44938.09375 | 7.91 |
| 44938.104166666664 | 7.91 |
| 44938.114583333336 | 7.91 |
| 44938.125 | 7.91 |
| 44938.135416666664 | 7.91 |
| 44938.145833333336 | 7.91 |
| 44938.15625 | 7.91 |
| 44938.166666666664 | 7.9 |
| 44938.177083333336 | 7.91 |
| 44938.1875 | 7.9 |
| 44938.197916666664 | 7.9 |
| 44938.208333333336 | 7.9 |
| 44938.21875 | 7.9 |
| 44938.229166666664 | 7.9 |
| 44938.239583333336 | 7.89 |
| 44938.25 | 7.89 |
| 44938.260416666664 | 7.89 |
| 44938.270833333336 | 7.89 |
| 44938.28125 | 7.89 |
| 44938.291666666664 | 7.88 |
| 44938.302083333336 | 7.88 |
| 44938.3125 | 7.87 |
| 44938.322916666664 | 7.86 |
| 44938.333333333336 | 7.86 |
| 44938.34375 | 7.86 |
| 44938.354166666664 | 7.85 |
| 44938.364583333336 | 7.86 |
| 44938.375 | 7.86 |
| 44938.385416666664 | 7.86 |
| 44938.395833333336 | 7.86 |
| 44938.40625 | 7.85 |
| 44938.416666666664 | 7.85 |
| 44938.427083333336 | 7.85 |
| 44938.4375 | 7.84 |
| 44938.447916666664 | 7.84 |
| 44938.458333333336 | 7.84 |
| 44938.46875 | 7.84 |
| 44938.479166666664 | 7.84 |
| 44938.489583333336 | 7.84 |
| 44938.5 | 7.84 |
| 44938.510416666664 | 7.85 |
| 44938.520833333336 | 7.85 |
| 44938.53125 | 7.86 |
| 44938.541666666664 | 7.87 |
| 44938.552083333336 | 7.87 |
| 44938.5625 | 7.87 |
| 44938.572916666664 | 7.87 |
| 44938.583333333336 | 7.87 |
| 44938.59375 | 7.87 |
| 44938.604166666664 | 7.87 |
| 44938.614583333336 | 7.87 |
| 44938.625 | 7.87 |
| 44938.635416666664 | 7.87 |
| 44938.645833333336 | 7.87 |
| 44938.65625 | 7.88 |
| 44938.666666666664 | 7.88 |
| 44938.677083333336 | 7.88 |
| 44938.6875 | 7.89 |
| 44938.697916666664 | 7.89 |
| 44938.708333333336 | 7.89 |
| 44938.71875 | 7.9 |
| 44938.729166666664 | 7.89 |
| 44938.739583333336 | 7.88 |
| 44938.75 | 7.89 |
| 44938.760416666664 | 7.9 |
| 44938.770833333336 | 7.9 |
| 44938.78125 | 7.9 |
| 44938.791666666664 | 7.91 |
| 44938.802083333336 | 7.9 |
| 44938.8125 | 7.9 |
| 44938.822916666664 | 7.91 |
| 44938.833333333336 | 7.9 |
| 44938.84375 | 7.9 |
| 44938.854166666664 | 7.9 |
| 44938.864583333336 | 7.91 |
| 44938.875 | 7.91 |
| 44938.885416666664 | 7.91 |
| 44938.895833333336 | 7.91 |
| 44938.90625 | 7.91 |
| 44938.916666666664 | 7.9 |
| 44938.927083333336 | 7.9 |
| 44938.9375 | 7.9 |
| 44938.947916666664 | 7.9 |
| 44938.958333333336 | 7.89 |
| 44938.96875 | 7.89 |
| 44938.979166666664 | 7.89 |
| 44938.989583333336 | 7.89 |
| 44939.0 | 7.89 |
| 44939.010416666664 | 7.89 |
| 44939.020833333336 | 7.89 |
| 44939.03125 | 7.89 |
| 44939.041666666664 | 7.9 |
| 44939.052083333336 | 7.9 |
| 44939.0625 | 7.9 |
| 44939.072916666664 | 7.9 |
| 44939.083333333336 | 7.9 |
| 44939.09375 | 7.9 |
| 44939.104166666664 | 7.89 |
| 44939.114583333336 | 7.89 |
| 44939.125 | 7.89 |
| 44939.135416666664 | 7.89 |
| 44939.145833333336 | 7.89 |
| 44939.15625 | 7.89 |
| 44939.166666666664 | 7.89 |
| 44939.177083333336 | 7.88 |
| 44939.1875 | 7.88 |
| 44939.197916666664 | 7.88 |
| 44939.208333333336 | 7.88 |
| 44939.21875 | 7.88 |
| 44939.229166666664 | 7.88 |
| 44939.239583333336 | 7.87 |
| 44939.25 | 7.87 |
| 44939.260416666664 | 7.87 |
| 44939.270833333336 | 7.87 |
| 44939.28125 | 7.86 |
| 44939.291666666664 | 7.85 |
| 44939.302083333336 | 7.85 |
| 44939.3125 | 7.85 |
| 44939.322916666664 | 7.86 |
| 44939.333333333336 | 7.84 |
| 44939.34375 | 7.83 |
| 44939.354166666664 | 7.83 |
| 44939.364583333336 | 7.82 |
| 44939.375 | 7.82 |
| 44939.385416666664 | 7.84 |
| 44939.395833333336 | 7.83 |
| 44939.40625 | 7.83 |
| 44939.416666666664 | 7.82 |
| 44939.427083333336 | 7.82 |
| 44939.4375 | 7.82 |
| 44939.447916666664 | 7.82 |
| 44939.458333333336 | 7.81 |
| 44939.46875 | 7.81 |
| 44939.479166666664 | 7.81 |
| 44939.489583333336 | 7.81 |
| 44939.5 | 7.81 |
| 44939.510416666664 | 7.81 |
| 44939.520833333336 | 7.8 |
| 44939.53125 | 7.8 |
| 44939.541666666664 | 7.81 |
| 44939.552083333336 | 7.81 |
| 44939.5625 | 7.81 |
| 44939.572916666664 | 7.82 |
| 44939.583333333336 | 7.82 |
| 44939.59375 | 7.82 |
| 44939.604166666664 | 7.82 |
| 44939.614583333336 | 7.82 |
| 44939.625 | 7.82 |
| 44939.635416666664 | 7.82 |
| 44939.645833333336 | 7.82 |
| 44939.65625 | 7.82 |
| 44939.666666666664 | 7.82 |
| 44939.677083333336 | 7.82 |
| 44939.6875 | 7.83 |
| 44939.697916666664 | 7.83 |
| 44939.708333333336 | 7.83 |
| 44939.71875 | 7.83 |
| 44939.729166666664 | 7.83 |
| 44939.739583333336 | 7.82 |
| 44939.75 | 7.83 |
| 44939.760416666664 | 7.83 |
| 44939.770833333336 | 7.83 |
| 44939.78125 | 7.83 |
| 44939.791666666664 | 7.84 |
| 44939.802083333336 | 7.84 |
| 44939.8125 | 7.84 |
| 44939.822916666664 | 7.85 |
| 44939.833333333336 | 7.85 |
| 44939.84375 | 7.85 |
| 44939.854166666664 | 7.86 |
| 44939.864583333336 | 7.87 |
| 44939.875 | 7.87 |
| 44939.885416666664 | 7.87 |
| 44939.895833333336 | 7.87 |
| 44939.90625 | 7.87 |
| 44939.916666666664 | 7.87 |
| 44939.927083333336 | 7.87 |
| 44939.9375 | 7.87 |
| 44939.947916666664 | 7.87 |
| 44939.958333333336 | 7.87 |
| 44939.96875 | 7.87 |
| 44939.979166666664 | 7.86 |
| 44939.989583333336 | 7.87 |
| 44940.0 | 7.87 |
| 44940.010416666664 | 7.87 |
| 44940.020833333336 | 7.87 |
| 44940.03125 | 7.86 |
| 44940.041666666664 | 7.86 |
| 44940.052083333336 | 7.86 |
| 44940.0625 | 7.85 |
| 44940.072916666664 | 7.85 |
| 44940.083333333336 | 7.85 |
| 44940.09375 | 7.85 |
| 44940.104166666664 | 7.85 |
| 44940.114583333336 | 7.85 |
| 44940.125 | 7.85 |
| 44940.135416666664 | 7.85 |
| 44940.145833333336 | 7.85 |
| 44940.15625 | 7.84 |
| 44940.166666666664 | 7.84 |
| 44940.177083333336 | 7.84 |
| 44940.1875 | 7.84 |
| 44940.197916666664 | 7.84 |
| 44940.208333333336 | 7.84 |
| 44940.21875 | 7.85 |
| 44940.229166666664 | 7.85 |
| 44940.239583333336 | 7.85 |
| 44940.25 | 7.85 |
| 44940.260416666664 | 7.86 |
| 44940.270833333336 | 7.85 |
| 44940.28125 | 7.86 |
| 44940.291666666664 | 7.85 |
| 44940.302083333336 | 7.86 |
| 44940.3125 | 7.85 |
| 44940.322916666664 | 7.85 |
| 44940.333333333336 | 7.85 |
| 44940.34375 | 7.84 |
| 44940.354166666664 | 7.84 |
| 44940.364583333336 | 7.83 |
| 44940.375 | 7.83 |
| 44940.385416666664 | 7.82 |
| 44940.395833333336 | 7.81 |
| 44940.40625 | 7.81 |
| 44940.416666666664 | 7.8 |
| 44940.427083333336 | 7.79 |
| 44940.4375 | 7.79 |
| 44940.447916666664 | 7.79 |
| 44940.458333333336 | 7.79 |
| 44940.46875 | 7.82 |
| 44940.479166666664 | 7.81 |
| 44940.489583333336 | 7.81 |
| 44940.5 | 7.81 |
| 44940.510416666664 | 7.81 |
| 44940.520833333336 | 7.81 |
| 44940.53125 | 7.8 |
| 44940.541666666664 | 7.8 |
| 44940.552083333336 | 7.8 |
| 44940.5625 | 7.8 |
| 44940.572916666664 | 7.8 |
| 44940.583333333336 | 7.8 |
| 44940.59375 | 7.8 |
| 44940.604166666664 | 7.81 |
| 44940.614583333336 | 7.81 |
| 44940.625 | 7.82 |
| 44940.635416666664 | 7.82 |
| 44940.645833333336 | 7.82 |
| 44940.65625 | 7.83 |
| 44940.666666666664 | 7.83 |
| 44940.677083333336 | 7.83 |
| 44940.6875 | 7.83 |
| 44940.697916666664 | 7.83 |
| 44940.708333333336 | 7.84 |
| 44940.71875 | 7.84 |
| 44940.729166666664 | 7.84 |
| 44940.739583333336 | 7.84 |
| 44940.75 | 7.85 |
| 44940.760416666664 | 7.85 |
| 44940.770833333336 | 7.85 |
| 44940.78125 | 7.85 |
| 44940.791666666664 | 7.86 |
| 44940.802083333336 | 7.86 |
| 44940.8125 | 7.86 |
| 44940.822916666664 | 7.86 |
| 44940.833333333336 | 7.86 |
| 44940.84375 | 7.87 |
| 44940.854166666664 | 7.87 |
| 44940.864583333336 | 7.87 |
| 44940.875 | 7.87 |
| 44940.885416666664 | 7.87 |
| 44940.895833333336 | 7.87 |
| 44940.90625 | 7.87 |
| 44940.916666666664 | 7.87 |
| 44940.927083333336 | 7.87 |
| 44940.9375 | 7.87 |
| 44940.947916666664 | 7.87 |
| 44940.958333333336 | 7.86 |
| 44940.96875 | 7.86 |
| 44940.979166666664 | 7.86 |
| 44940.989583333336 | 7.86 |
| 44941.0 | 7.86 |
| 44941.010416666664 | 7.86 |
| 44941.020833333336 | 7.86 |
| 44941.03125 | 7.85 |
| 44941.041666666664 | 7.85 |
| 44941.052083333336 | 7.85 |
| 44941.0625 | 7.85 |
| 44941.072916666664 | 7.85 |
| 44941.083333333336 | 7.85 |
| 44941.09375 | 7.85 |
| 44941.104166666664 | 7.85 |
| 44941.114583333336 | 7.86 |
| 44941.125 | 7.86 |
| 44941.135416666664 | 7.86 |
| 44941.145833333336 | 7.86 |
| 44941.15625 | 7.86 |
| 44941.166666666664 | 7.86 |
| 44941.177083333336 | 7.86 |
| 44941.1875 | 7.86 |
| 44941.197916666664 | 7.87 |
| 44941.208333333336 | 7.87 |
| 44941.21875 | 7.87 |
| 44941.229166666664 | 7.87 |
| 44941.239583333336 | 7.87 |
| 44941.25 | 7.87 |
| 44941.260416666664 | 7.87 |
| 44941.270833333336 | 7.87 |
| 44941.28125 | 7.87 |
| 44941.291666666664 | 7.87 |
| 44941.302083333336 | 7.87 |
| 44941.3125 | 7.87 |
| 44941.322916666664 | 7.87 |
| 44941.333333333336 | 7.88 |
| 44941.34375 | 7.87 |
| 44941.354166666664 | 7.88 |
| 44941.364583333336 | 7.87 |
| 44941.375 | 7.87 |
| 44941.385416666664 | 7.87 |
| 44941.395833333336 | 7.87 |
| 44941.40625 | 7.87 |
| 44941.416666666664 | 7.86 |
| 44941.427083333336 | 7.85 |
| 44941.4375 | 7.85 |
| 44941.447916666664 | 7.85 |
| 44941.458333333336 | 7.84 |
| 44941.46875 | 7.83 |
| 44941.479166666664 | 7.83 |
| 44941.489583333336 | 7.82 |
| 44941.5 | 7.82 |
| 44941.510416666664 | 7.82 |
| 44941.520833333336 | 7.81 |
| 44941.53125 | 7.82 |
| 44941.541666666664 | 7.83 |
| 44941.552083333336 | 7.83 |
| 44941.5625 | 7.83 |
| 44941.572916666664 | 7.83 |
| 44941.583333333336 | 7.83 |
| 44941.59375 | 7.83 |
| 44941.604166666664 | 7.83 |
| 44941.614583333336 | 7.83 |
| 44941.625 | 7.84 |
| 44941.635416666664 | 7.84 |
| 44941.645833333336 | 7.85 |
| 44941.65625 | 7.85 |
| 44941.666666666664 | 7.86 |
| 44941.677083333336 | 7.86 |
| 44941.6875 | 7.86 |
| 44941.697916666664 | 7.86 |
| 44941.708333333336 | 7.87 |
| 44941.71875 | 7.87 |
| 44941.729166666664 | 7.87 |
| 44941.739583333336 | 7.87 |
| 44941.75 | 7.87 |
| 44941.760416666664 | 7.88 |
| 44941.770833333336 | 7.88 |
| 44941.78125 | 7.88 |
| 44941.791666666664 | 7.88 |
| 44941.802083333336 | 7.89 |
| 44941.8125 | 7.89 |
| 44941.822916666664 | 7.89 |
| 44941.833333333336 | 7.89 |
| 44941.84375 | 7.89 |
| 44941.854166666664 | 7.89 |
| 44941.864583333336 | 7.9 |
| 44941.875 | 7.9 |
| 44941.885416666664 | 7.9 |
| 44941.895833333336 | 7.9 |
| 44941.90625 | 7.91 |
| 44941.916666666664 | 7.91 |
| 44941.927083333336 | 7.91 |
| 44941.9375 | 7.91 |
| 44941.947916666664 | 7.91 |
| 44941.958333333336 | 7.91 |
| 44941.96875 | 7.9 |
| 44941.979166666664 | 7.9 |
| 44941.989583333336 | 7.9 |
| 44942.0 | 7.9 |
| 44942.010416666664 | 7.9 |
| 44942.020833333336 | 7.89 |
| 44942.03125 | 7.89 |
| 44942.041666666664 | 7.88 |
| 44942.052083333336 | 7.88 |
| 44942.0625 | 7.87 |
| 44942.072916666664 | 7.88 |
| 44942.083333333336 | 7.87 |
| 44942.09375 | 7.88 |
| 44942.104166666664 | 7.88 |
| 44942.114583333336 | 7.88 |
| 44942.125 | 7.88 |
| 44942.135416666664 | 7.88 |
| 44942.145833333336 | 7.88 |
| 44942.15625 | 7.89 |
| 44942.166666666664 | 7.89 |
| 44942.177083333336 | 7.89 |
| 44942.1875 | 7.89 |
| 44942.197916666664 | 7.89 |
| 44942.208333333336 | 7.89 |
| 44942.21875 | 7.89 |
| 44942.229166666664 | 7.89 |
| 44942.239583333336 | 7.89 |
| 44942.25 | 7.89 |
| 44942.260416666664 | 7.89 |
| 44942.270833333336 | 7.89 |
| 44942.28125 | 7.89 |
| 44942.291666666664 | 7.89 |
| 44942.302083333336 | 7.89 |
| 44942.3125 | 7.89 |
| 44942.322916666664 | 7.89 |
| 44942.333333333336 | 7.9 |
| 44942.34375 | 7.89 |
| 44942.354166666664 | 7.9 |
| 44942.364583333336 | 7.87 |
| 44942.375 | 7.52 |
| 44942.385416666664 | 7.68 |
| 44942.395833333336 | 7.87 |
| 44942.40625 | 7.87 |
| 44942.416666666664 | 7.87 |
| 44942.427083333336 | 7.88 |
| 44942.4375 | 7.88 |
| 44942.447916666664 | 7.88 |
| 44942.458333333336 | 7.88 |
| 44942.46875 | 7.87 |
| 44942.479166666664 | 7.87 |
| 44942.489583333336 | 7.86 |
| 44942.5 | 7.86 |
| 44942.510416666664 | 7.85 |
| 44942.520833333336 | 7.85 |
| 44942.53125 | 7.84 |
| 44942.541666666664 | 7.84 |
| 44942.552083333336 | 7.84 |
| 44942.5625 | 7.84 |
| 44942.572916666664 | 7.84 |
| 44942.583333333336 | 7.85 |
| 44942.59375 | 7.85 |
| 44942.604166666664 | 7.85 |
| 44942.614583333336 | 7.84 |
| 44942.625 | 7.84 |
| 44942.635416666664 | 7.85 |
| 44942.645833333336 | 7.85 |
| 44942.65625 | 7.85 |
| 44942.666666666664 | 7.85 |
| 44942.677083333336 | 7.86 |
| 44942.6875 | 7.86 |
| 44942.697916666664 | 7.87 |
| 44942.708333333336 | 7.88 |
| 44942.71875 | 7.89 |
| 44942.729166666664 | 7.9 |
| 44942.739583333336 | 7.9 |
| 44942.75 | 7.9 |
| 44942.760416666664 | 7.9 |
| 44942.770833333336 | 7.9 |
| 44942.78125 | 7.9 |
| 44942.791666666664 | 7.9 |
| 44942.802083333336 | 7.9 |
| 44942.8125 | 7.9 |
| 44942.822916666664 | 7.91 |
| 44942.833333333336 | 7.91 |
| 44942.84375 | 7.91 |
| 44942.854166666664 | 7.91 |
| 44942.864583333336 | 7.91 |
| 44942.875 | 7.92 |
| 44942.885416666664 | 7.92 |
| 44942.895833333336 | 7.92 |
| 44942.90625 | 7.92 |
| 44942.916666666664 | 7.93 |
| 44942.927083333336 | 7.92 |
| 44942.9375 | 7.92 |
| 44942.947916666664 | 7.92 |
| 44942.958333333336 | 7.92 |
| 44942.96875 | 7.92 |
| 44942.979166666664 | 7.92 |
| 44942.989583333336 | 7.92 |
| 44943.0 | 7.92 |
| 44943.010416666664 | 7.91 |
| 44943.020833333336 | 7.91 |
| 44943.03125 | 7.91 |
| 44943.041666666664 | 7.91 |
| 44943.052083333336 | 7.91 |
| 44943.0625 | 7.91 |
| 44943.072916666664 | 7.9 |
| 44943.083333333336 | 7.9 |
| 44943.09375 | 7.9 |
| 44943.104166666664 | 7.9 |
| 44943.114583333336 | 7.9 |
| 44943.125 | 7.9 |
| 44943.135416666664 | 7.9 |
| 44943.145833333336 | 7.9 |
| 44943.15625 | 7.9 |
| 44943.166666666664 | 7.9 |
| 44943.177083333336 | 7.9 |
| 44943.1875 | 7.9 |
| 44943.197916666664 | 7.9 |
| 44943.208333333336 | 7.91 |
| 44943.21875 | 7.91 |
| 44943.229166666664 | 7.91 |
| 44943.239583333336 | 7.91 |
| 44943.25 | 7.91 |
| 44943.260416666664 | 7.91 |
| 44943.270833333336 | 7.91 |
| 44943.28125 | 7.91 |
| 44943.291666666664 | 7.91 |
| 44943.302083333336 | 7.91 |
| 44943.3125 | 7.91 |
| 44943.322916666664 | 7.91 |
| 44943.333333333336 | 7.91 |
| 44943.34375 | 7.91 |
| 44943.354166666664 | 7.91 |
| 44943.364583333336 | 7.92 |
| 44943.375 | 7.92 |
| 44943.385416666664 | 7.92 |
| 44943.395833333336 | 7.92 |
| 44943.40625 | 7.91 |
| 44943.416666666664 | 7.91 |
| 44943.427083333336 | 7.91 |
| 44943.4375 | 7.91 |
| 44943.447916666664 | 7.91 |
| 44943.458333333336 | 7.91 |
| 44943.46875 | 7.9 |
| 44943.479166666664 | 7.9 |
| 44943.489583333336 | 7.89 |
| 44943.5 | 7.88 |
| 44943.510416666664 | 7.87 |
| 44943.520833333336 | 7.86 |
| 44943.53125 | 7.85 |
| 44943.541666666664 | 7.85 |
| 44943.552083333336 | 7.86 |
| 44943.5625 | 7.86 |
| 44943.572916666664 | 7.86 |
| 44943.583333333336 | 7.86 |
| 44943.59375 | 7.86 |
| 44943.604166666664 | 7.86 |
| 44943.614583333336 | 7.86 |
| 44943.625 | 7.86 |
| 44943.635416666664 | 7.86 |
| 44943.645833333336 | 7.86 |
| 44943.65625 | 7.86 |
| 44943.666666666664 | 7.86 |
| 44943.677083333336 | 7.86 |
| 44943.6875 | 7.86 |
| 44943.697916666664 | 7.86 |
| 44943.708333333336 | 7.86 |
| 44943.71875 | 7.86 |
| 44943.729166666664 | 7.87 |
| 44943.739583333336 | 7.88 |
| 44943.75 | 7.89 |
| 44943.760416666664 | 7.91 |
| 44943.770833333336 | 7.92 |
| 44943.78125 | 7.92 |
| 44943.791666666664 | 7.92 |
| 44943.802083333336 | 7.93 |
| 44943.8125 | 7.93 |
| 44943.822916666664 | 7.93 |
| 44943.833333333336 | 7.93 |
| 44943.84375 | 7.93 |
| 44943.854166666664 | 7.93 |
| 44943.864583333336 | 7.93 |
| 44943.875 | 7.93 |
| 44943.885416666664 | 7.93 |
| 44943.895833333336 | 7.93 |
| 44943.90625 | 7.93 |
| 44943.916666666664 | 7.93 |
| 44943.927083333336 | 7.93 |
| 44943.9375 | 7.93 |
| 44943.947916666664 | 7.93 |
| 44943.958333333336 | 7.93 |
| 44943.96875 | 7.93 |
| 44943.979166666664 | 7.93 |
| 44943.989583333336 | 7.93 |
| 44944.0 | 7.93 |
| 44944.010416666664 | 7.92 |
| 44944.020833333336 | 7.92 |
| 44944.03125 | 7.91 |
| 44944.041666666664 | 7.91 |
| 44944.052083333336 | 7.91 |
| 44944.0625 | 7.91 |
| 44944.072916666664 | 7.9 |
| 44944.083333333336 | 7.9 |
| 44944.09375 | 7.89 |
| 44944.104166666664 | 7.89 |
| 44944.114583333336 | 7.89 |
| 44944.125 | 7.88 |
| 44944.135416666664 | 7.88 |
| 44944.145833333336 | 7.88 |
| 44944.15625 | 7.88 |
| 44944.166666666664 | 7.88 |
| 44944.177083333336 | 7.88 |
| 44944.1875 | 7.88 |
| 44944.197916666664 | 7.88 |
| 44944.208333333336 | 7.88 |
| 44944.21875 | 7.89 |
| 44944.229166666664 | 7.9 |
| 44944.239583333336 | 7.9 |
| 44944.25 | 7.9 |
| 44944.260416666664 | 7.9 |
| 44944.270833333336 | 7.9 |
| 44944.28125 | 7.9 |
| 44944.291666666664 | 7.9 |
| 44944.302083333336 | 7.9 |
| 44944.3125 | 7.9 |
| 44944.322916666664 | 7.9 |
| 44944.333333333336 | 7.9 |
| 44944.34375 | 7.91 |
| 44944.354166666664 | 7.91 |
| 44944.364583333336 | 7.91 |
| 44944.375 | 7.91 |
| 44944.385416666664 | 7.91 |
| 44944.395833333336 | 7.9 |
| 44944.40625 | 7.9 |
| 44944.416666666664 | 7.9 |
| 44944.427083333336 | 7.9 |
| 44944.4375 | 7.9 |
| 44944.447916666664 | 7.9 |
| 44944.458333333336 | 7.9 |
| 44944.46875 | 7.9 |
| 44944.479166666664 | 7.89 |
| 44944.489583333336 | 7.89 |
| 44944.5 | 7.88 |
| 44944.510416666664 | 7.88 |
| 44944.520833333336 | 7.87 |
| 44944.53125 | 7.88 |
| 44944.541666666664 | 7.86 |
| 44944.552083333336 | 7.86 |
| 44944.5625 | 7.85 |
| 44944.572916666664 | 7.85 |
| 44944.583333333336 | 7.84 |
| 44944.59375 | 7.85 |
| 44944.604166666664 | 7.85 |
| 44944.614583333336 | 7.85 |
| 44944.625 | 7.85 |
| 44944.635416666664 | 7.84 |
| 44944.645833333336 | 7.84 |
| 44944.65625 | 7.84 |
| 44944.666666666664 | 7.84 |
| 44944.677083333336 | 7.84 |
| 44944.6875 | 7.84 |
| 44944.697916666664 | 7.84 |
| 44944.708333333336 | 7.85 |
| 44944.71875 | 7.85 |
| 44944.729166666664 | 7.85 |
| 44944.739583333336 | 7.86 |
| 44944.75 | 7.86 |
| 44944.760416666664 | 7.87 |
| 44944.770833333336 | 7.88 |
| 44944.78125 | 7.89 |
| 44944.791666666664 | 7.89 |
| 44944.802083333336 | 7.9 |
| 44944.8125 | 7.91 |
| 44944.822916666664 | 7.95 |
| 44944.833333333336 | 7.96 |
| 44944.84375 | 7.96 |
| 44944.854166666664 | 7.96 |
| 44944.864583333336 | 7.97 |
| 44944.875 | 7.98 |
| 44944.885416666664 | 7.98 |
| 44944.895833333336 | 7.99 |
| 44944.90625 | 7.99 |
| 44944.916666666664 | 8 |
| 44944.927083333336 | 8 |
| 44944.9375 | 8.01 |
| 44944.947916666664 | 8.01 |
| 44944.958333333336 | 8.01 |
| 44944.96875 | 8.01 |
| 44944.979166666664 | 8.01 |
| 44944.989583333336 | 8.01 |
| 44945.0 | 8.01 |
| 44945.010416666664 | 8.01 |
| 44945.020833333336 | 8.01 |
| 44945.03125 | 8 |
| 44945.041666666664 | 8 |
| 44945.052083333336 | 8 |
| 44945.0625 | 8 |
| 44945.072916666664 | 8 |
| 44945.083333333336 | 7.99 |
| 44945.09375 | 7.99 |
| 44945.104166666664 | 7.98 |
| 44945.114583333336 | 7.98 |
| 44945.125 | 7.97 |
| 44945.135416666664 | 7.96 |
| 44945.145833333336 | 7.96 |
| 44945.15625 | 7.96 |
| 44945.166666666664 | 7.96 |
| 44945.177083333336 | 7.96 |
| 44945.1875 | 7.96 |
| 44945.197916666664 | 7.96 |
| 44945.208333333336 | 7.96 |
| 44945.21875 | 7.96 |
| 44945.229166666664 | 7.96 |
| 44945.239583333336 | 7.96 |
| 44945.25 | 7.97 |
| 44945.260416666664 | 7.97 |
| 44945.270833333336 | 7.98 |
| 44945.28125 | 7.98 |
| 44945.291666666664 | 7.98 |
| 44945.302083333336 | 7.98 |
| 44945.3125 | 7.98 |
| 44945.322916666664 | 7.98 |
| 44945.333333333336 | 7.98 |
| 44945.34375 | 7.98 |
| 44945.354166666664 | 7.98 |
| 44945.364583333336 | 7.98 |
| 44945.375 | 7.98 |
| 44945.385416666664 | 7.99 |
| 44945.395833333336 | 7.99 |
| 44945.40625 | 7.99 |
| 44945.416666666664 | 7.99 |
| 44945.427083333336 | 7.99 |
| 44945.4375 | 7.99 |
| 44945.447916666664 | 7.98 |
| 44945.458333333336 | 7.98 |
| 44945.46875 | 7.98 |
| 44945.479166666664 | 7.97 |
| 44945.489583333336 | 7.76 |
| 44945.5 | 7.97 |
| 44945.510416666664 | 7.98 |
| 44945.520833333336 | 7.98 |
| 44945.53125 | 7.97 |
| 44945.541666666664 | 7.97 |
| 44945.552083333336 | 7.96 |
| 44945.5625 | 7.96 |
| 44945.572916666664 | 7.96 |
| 44945.583333333336 | 7.95 |
| 44945.59375 | 7.94 |
| 44945.604166666664 | 7.93 |
| 44945.614583333336 | 7.93 |
| 44945.625 | 7.94 |
| 44945.635416666664 | 7.95 |
| 44945.645833333336 | 7.95 |
| 44945.65625 | 7.95 |
| 44945.666666666664 | 7.95 |
| 44945.677083333336 | 7.95 |
| 44945.6875 | 7.95 |
| 44945.697916666664 | 7.95 |
| 44945.708333333336 | 7.95 |
| 44945.71875 | 7.95 |
| 44945.729166666664 | 7.95 |
| 44945.739583333336 | 7.96 |
| 44945.75 | 7.96 |
| 44945.760416666664 | 7.96 |
| 44945.770833333336 | 7.96 |
| 44945.78125 | 7.97 |
| 44945.791666666664 | 7.97 |
| 44945.802083333336 | 7.98 |
| 44945.8125 | 7.99 |
| 44945.822916666664 | 7.99 |
| 44945.833333333336 | 8 |
| 44945.84375 | 8 |
| 44945.854166666664 | 8 |
| 44945.864583333336 | 8 |
| 44945.875 | 8 |
| 44945.885416666664 | 8 |
| 44945.895833333336 | 7.99 |
| 44945.90625 | 8 |
| 44945.916666666664 | 8 |
| 44945.927083333336 | 8 |
| 44945.9375 | 8.01 |
| 44945.947916666664 | 8 |
| 44945.958333333336 | 8 |
| 44945.96875 | 8 |
| 44945.979166666664 | 8 |
| 44945.989583333336 | 8.01 |
| 44946.0 | 8 |
| 44946.010416666664 | 8 |
| 44946.020833333336 | 7.99 |
| 44946.03125 | 7.98 |
| 44946.041666666664 | 7.98 |
| 44946.052083333336 | 7.98 |
| 44946.0625 | 7.98 |
| 44946.072916666664 | 7.96 |
| 44946.083333333336 | 7.96 |
| 44946.09375 | 7.96 |
| 44946.104166666664 | 7.94 |
| 44946.114583333336 | 7.95 |
| 44946.125 | 7.96 |
| 44946.135416666664 | 7.96 |
| 44946.145833333336 | 7.95 |
| 44946.15625 | 7.95 |
| 44946.166666666664 | 7.94 |
| 44946.177083333336 | 7.94 |
| 44946.1875 | 7.93 |
| 44946.197916666664 | 7.93 |
| 44946.208333333336 | 7.92 |
| 44946.21875 | 7.92 |
| 44946.229166666664 | 7.92 |
| 44946.239583333336 | 7.92 |
| 44946.25 | 7.92 |
| 44946.260416666664 | 7.92 |
| 44946.270833333336 | 7.92 |
| 44946.28125 | 7.92 |
| 44946.291666666664 | 7.93 |
| 44946.302083333336 | 7.93 |
| 44946.3125 | 7.93 |
| 44946.322916666664 | 7.93 |
| 44946.333333333336 | 7.93 |
| 44946.34375 | 7.93 |
| 44946.354166666664 | 7.93 |
| 44946.364583333336 | 7.92 |
| 44946.375 | 7.93 |
| 44946.385416666664 | 7.94 |
| 44946.395833333336 | 7.94 |
| 44946.40625 | 7.95 |
| 44946.416666666664 | 7.95 |
| 44946.427083333336 | 7.95 |
| 44946.4375 | 7.95 |
| 44946.447916666664 | 7.95 |
| 44946.458333333336 | 7.95 |
| 44946.46875 | 7.94 |
| 44946.479166666664 | 7.94 |
| 44946.489583333336 | 7.94 |
| 44946.5 | 7.94 |
| 44946.510416666664 | 7.94 |
| 44946.520833333336 | 7.95 |
| 44946.53125 | 7.94 |
| 44946.541666666664 | 7.94 |
| 44946.552083333336 | 7.94 |
| 44946.5625 | 7.94 |
| 44946.572916666664 | 7.94 |
| 44946.583333333336 | 7.91 |
| 44946.59375 | 7.93 |
| 44946.604166666664 | 7.93 |
| 44946.614583333336 | 7.92 |
| 44946.625 | 7.92 |
| 44946.635416666664 | 7.91 |
| 44946.645833333336 | 7.91 |
| 44946.65625 | 7.91 |
| 44946.666666666664 | 7.91 |
| 44946.677083333336 | 7.91 |
| 44946.6875 | 7.91 |
| 44946.697916666664 | 7.92 |
| 44946.708333333336 | 7.92 |
| 44946.71875 | 7.91 |
| 44946.729166666664 | 7.91 |
| 44946.739583333336 | 7.9 |
| 44946.75 | 7.9 |
| 44946.760416666664 | 7.9 |
| 44946.770833333336 | 7.9 |
| 44946.78125 | 7.9 |
| 44946.791666666664 | 7.91 |
| 44946.802083333336 | 7.91 |
| 44946.8125 | 7.91 |
| 44946.822916666664 | 7.91 |
| 44946.833333333336 | 7.93 |
| 44946.84375 | 7.94 |
| 44946.854166666664 | 7.94 |
| 44946.864583333336 | 7.95 |
| 44946.875 | 7.95 |
| 44946.885416666664 | 7.96 |
| 44946.895833333336 | 7.96 |
| 44946.90625 | 7.96 |
| 44946.916666666664 | 7.96 |
| 44946.927083333336 | 7.96 |
| 44946.9375 | 7.96 |
| 44946.947916666664 | 7.97 |
| 44946.958333333336 | 7.97 |
| 44946.96875 | 7.97 |
| 44946.979166666664 | 7.97 |
| 44946.989583333336 | 7.97 |
| 44947.0 | 7.97 |
| 44947.010416666664 | 7.97 |
| 44947.020833333336 | 7.97 |
| 44947.03125 | 7.97 |
| 44947.041666666664 | 7.97 |
| 44947.052083333336 | 7.96 |
| 44947.0625 | 7.96 |
| 44947.072916666664 | 7.95 |
| 44947.083333333336 | 7.94 |
| 44947.09375 | 7.94 |
| 44947.104166666664 | 7.92 |
| 44947.114583333336 | 7.91 |
| 44947.125 | 7.91 |
| 44947.135416666664 | 7.91 |
| 44947.145833333336 | 7.9 |
| 44947.15625 | 7.9 |
| 44947.166666666664 | 7.9 |
| 44947.177083333336 | 7.9 |
| 44947.1875 | 7.9 |
| 44947.197916666664 | 7.89 |
| 44947.208333333336 | 7.88 |
| 44947.21875 | 7.87 |
| 44947.229166666664 | 7.87 |
| 44947.239583333336 | 7.87 |
| 44947.25 | 7.86 |
| 44947.260416666664 | 7.87 |
| 44947.270833333336 | 7.87 |
| 44947.28125 | 7.87 |
| 44947.291666666664 | 7.86 |
| 44947.302083333336 | 7.87 |
| 44947.3125 | 7.87 |
| 44947.322916666664 | 7.87 |
| 44947.333333333336 | 7.88 |
| 44947.34375 | 7.89 |
| 44947.354166666664 | 7.9 |
| 44947.364583333336 | 7.9 |
| 44947.375 | 7.9 |
| 44947.385416666664 | 7.89 |
| 44947.395833333336 | 7.89 |
| 44947.40625 | 7.9 |
| 44947.416666666664 | 7.9 |
| 44947.427083333336 | 7.91 |
| 44947.4375 | 7.92 |
| 44947.447916666664 | 7.93 |
| 44947.458333333336 | 7.94 |
| 44947.46875 | 7.94 |
| 44947.479166666664 | 7.94 |
| 44947.489583333336 | 7.93 |
| 44947.5 | 7.93 |
| 44947.510416666664 | 7.93 |
| 44947.520833333336 | 7.93 |
| 44947.53125 | 7.94 |
| 44947.541666666664 | 7.94 |
| 44947.552083333336 | 7.94 |
| 44947.5625 | 7.94 |
| 44947.572916666664 | 7.93 |
| 44947.583333333336 | 7.94 |
| 44947.59375 | 7.93 |
| 44947.604166666664 | 7.93 |
| 44947.614583333336 | 7.93 |
| 44947.625 | 7.93 |
| 44947.635416666664 | 7.93 |
| 44947.645833333336 | 7.93 |
| 44947.65625 | 7.92 |
| 44947.666666666664 | 7.92 |
| 44947.677083333336 | 7.92 |
| 44947.6875 | 7.92 |
| 44947.697916666664 | 7.93 |
| 44947.708333333336 | 7.93 |
| 44947.71875 | 7.93 |
| 44947.729166666664 | 7.92 |
| 44947.739583333336 | 7.92 |
| 44947.75 | 7.91 |
| 44947.760416666664 | 7.9 |
| 44947.770833333336 | 7.9 |
| 44947.78125 | 7.9 |
| 44947.791666666664 | 7.9 |
| 44947.802083333336 | 7.9 |
| 44947.8125 | 7.9 |
| 44947.822916666664 | 7.91 |
| 44947.833333333336 | 7.91 |
| 44947.84375 | 7.91 |
| 44947.854166666664 | 7.91 |
| 44947.864583333336 | 7.91 |
| 44947.875 | 7.92 |
| 44947.885416666664 | 7.93 |
| 44947.895833333336 | 7.94 |
| 44947.90625 | 7.95 |
| 44947.916666666664 | 7.95 |
| 44947.927083333336 | 7.95 |
| 44947.9375 | 7.95 |
| 44947.947916666664 | 7.96 |
| 44947.958333333336 | 7.96 |
| 44947.96875 | 7.96 |
| 44947.979166666664 | 7.97 |
| 44947.989583333336 | 7.97 |
| 44948.0 | 7.98 |
| 44948.010416666664 | 7.98 |
| 44948.020833333336 | 7.98 |
| 44948.03125 | 7.98 |
| 44948.041666666664 | 7.97 |
| 44948.052083333336 | 7.97 |
| 44948.0625 | 7.97 |
| 44948.072916666664 | 7.97 |
| 44948.083333333336 | 7.97 |
| 44948.09375 | 7.96 |
| 44948.104166666664 | 7.96 |
| 44948.114583333336 | 7.96 |
| 44948.125 | 7.96 |
| 44948.135416666664 | 7.95 |
| 44948.145833333336 | 7.94 |
| 44948.15625 | 7.93 |
| 44948.166666666664 | 7.92 |
| 44948.177083333336 | 7.9 |
| 44948.1875 | 7.9 |
| 44948.197916666664 | 7.89 |
| 44948.208333333336 | 7.89 |
| 44948.21875 | 7.9 |
| 44948.229166666664 | 7.9 |
| 44948.239583333336 | 7.89 |
| 44948.25 | 7.89 |
| 44948.260416666664 | 7.88 |
| 44948.270833333336 | 7.88 |
| 44948.28125 | 7.88 |
| 44948.291666666664 | 7.87 |
| 44948.302083333336 | 7.87 |
| 44948.3125 | 7.87 |
| 44948.322916666664 | 7.87 |
| 44948.333333333336 | 7.87 |
| 44948.34375 | 7.87 |
| 44948.354166666664 | 7.88 |
| 44948.364583333336 | 7.88 |
| 44948.375 | 7.89 |
| 44948.385416666664 | 7.89 |
| 44948.395833333336 | 7.89 |
| 44948.40625 | 7.9 |
| 44948.416666666664 | 7.9 |
| 44948.427083333336 | 7.9 |
| 44948.4375 | 7.91 |
| 44948.447916666664 | 7.91 |
| 44948.458333333336 | 7.92 |
| 44948.46875 | 7.93 |
| 44948.479166666664 | 7.94 |
| 44948.489583333336 | 7.94 |
| 44948.5 | 7.95 |
| 44948.510416666664 | 7.94 |
| 44948.520833333336 | 7.94 |
| 44948.53125 | 7.93 |
| 44948.541666666664 | 7.94 |
| 44948.552083333336 | 7.95 |
| 44948.5625 | 7.95 |
| 44948.572916666664 | 7.96 |
| 44948.583333333336 | 7.96 |
| 44948.59375 | 7.96 |
| 44948.604166666664 | 7.96 |
| 44948.614583333336 | 7.94 |
| 44948.625 | 7.95 |
| 44948.635416666664 | 7.96 |
| 44948.645833333336 | 7.95 |
| 44948.65625 | 7.94 |
| 44948.666666666664 | 7.94 |
| 44948.677083333336 | 7.93 |
| 44948.6875 | 7.93 |
| 44948.697916666664 | 7.92 |
| 44948.708333333336 | 7.91 |
| 44948.71875 | 7.91 |
| 44948.729166666664 | 7.89 |
| 44948.739583333336 | 7.9 |
| 44948.75 | 7.89 |
| 44948.760416666664 | 7.89 |
| 44948.770833333336 | 7.89 |
| 44948.78125 | 7.9 |
| 44948.791666666664 | 7.89 |
| 44948.802083333336 | 7.88 |
| 44948.8125 | 7.88 |
| 44948.822916666664 | 7.87 |
| 44948.833333333336 | 7.86 |
| 44948.84375 | 7.86 |
| 44948.854166666664 | 7.85 |
| 44948.864583333336 | 7.86 |
| 44948.875 | 7.86 |
| 44948.885416666664 | 7.86 |
| 44948.895833333336 | 7.87 |
| 44948.90625 | 7.88 |
| 44948.916666666664 | 7.89 |
| 44948.927083333336 | 7.9 |
| 44948.9375 | 7.91 |
| 44948.947916666664 | 7.92 |
| 44948.958333333336 | 7.92 |
| 44948.96875 | 7.92 |
| 44948.979166666664 | 7.93 |
| 44948.989583333336 | 7.94 |
| 44949.0 | 7.95 |
| 44949.010416666664 | 7.95 |
| 44949.020833333336 | 7.95 |
| 44949.03125 | 7.96 |
| 44949.041666666664 | 7.96 |
| 44949.052083333336 | 7.96 |
| 44949.0625 | 7.96 |
| 44949.072916666664 | 7.95 |
| 44949.083333333336 | 7.95 |
| 44949.09375 | 7.94 |
| 44949.104166666664 | 7.94 |
| 44949.114583333336 | 7.95 |
| 44949.125 | 7.94 |
| 44949.135416666664 | 7.94 |
| 44949.145833333336 | 7.94 |
| 44949.15625 | 7.94 |
| 44949.166666666664 | 7.94 |
| 44949.177083333336 | 7.94 |
| 44949.1875 | 7.93 |
| 44949.197916666664 | 7.92 |
| 44949.208333333336 | 7.92 |
| 44949.21875 | 7.92 |
| 44949.229166666664 | 7.91 |
| 44949.239583333336 | 7.9 |
| 44949.25 | 7.9 |
| 44949.260416666664 | 7.89 |
| 44949.270833333336 | 7.88 |
| 44949.28125 | 7.87 |
| 44949.291666666664 | 7.86 |
| 44949.302083333336 | 7.84 |
| 44949.3125 | 7.83 |
| 44949.322916666664 | 7.82 |
| 44949.333333333336 | 7.82 |
| 44949.34375 | 7.81 |
| 44949.354166666664 | 7.82 |
| 44949.364583333336 | 7.82 |
| 44949.375 | 7.82 |
| 44949.385416666664 | 7.83 |
| 44949.395833333336 | 7.84 |
| 44949.40625 | 7.85 |
| 44949.416666666664 | 7.87 |
| 44949.427083333336 | 7.87 |
| 44949.4375 | 7.88 |
| 44949.447916666664 | 7.88 |
| 44949.458333333336 | 7.89 |
| 44949.46875 | 7.89 |
| 44949.479166666664 | 7.89 |
| 44949.489583333336 | 7.9 |
| 44949.5 | 7.91 |
| 44949.510416666664 | 7.92 |
| 44949.520833333336 | 7.92 |
| 44949.53125 | 7.93 |
| 44949.541666666664 | 7.93 |
| 44949.552083333336 | 7.92 |
| 44949.5625 | 7.92 |
| 44949.572916666664 | 7.92 |
| 44949.583333333336 | 7.92 |
| 44949.59375 | 7.92 |
| 44949.604166666664 | 7.92 |
| 44949.614583333336 | 7.92 |
| 44949.625 | 7.93 |
| 44949.635416666664 | 7.92 |
| 44949.645833333336 | 7.93 |
| 44949.65625 | 7.93 |
| 44949.666666666664 | 7.93 |
| 44949.677083333336 | 7.93 |
| 44949.6875 | 7.93 |
| 44949.697916666664 | 7.93 |
| 44949.708333333336 | 7.92 |
| 44949.71875 | 7.92 |
| 44949.729166666664 | 7.92 |
| 44949.739583333336 | 7.92 |
| 44949.75 | 7.93 |
| 44949.760416666664 | 7.93 |
| 44949.770833333336 | 7.93 |
| 44949.78125 | 7.93 |
| 44949.791666666664 | 7.93 |
| 44949.802083333336 | 7.93 |
| 44949.8125 | 7.92 |
| 44949.822916666664 | 7.91 |
| 44949.833333333336 | 7.9 |
| 44949.84375 | 7.89 |
| 44949.854166666664 | 7.88 |
| 44949.864583333336 | 7.87 |
| 44949.875 | 7.86 |
| 44949.885416666664 | 7.86 |
| 44949.895833333336 | 7.86 |
| 44949.90625 | 7.86 |
| 44949.916666666664 | 7.85 |
| 44949.927083333336 | 7.86 |
| 44949.9375 | 7.87 |
| 44949.947916666664 | 7.89 |
| 44949.958333333336 | 7.91 |
| 44949.96875 | 7.91 |
| 44949.979166666664 | 7.92 |
| 44949.989583333336 | 7.92 |
| 44950.0 | 7.92 |
| 44950.010416666664 | 7.92 |
| 44950.020833333336 | 7.93 |
| 44950.03125 | 7.93 |
| 44950.041666666664 | 7.93 |
| 44950.052083333336 | 7.93 |
| 44950.0625 | 7.93 |
| 44950.072916666664 | 7.93 |
| 44950.083333333336 | 7.94 |
| 44950.09375 | 7.94 |
| 44950.104166666664 | 7.94 |
| 44950.114583333336 | 7.94 |
| 44950.125 | 7.94 |
| 44950.135416666664 | 7.93 |
| 44950.145833333336 | 7.93 |
| 44950.15625 | 7.93 |
| 44950.166666666664 | 7.93 |
| 44950.177083333336 | 7.92 |
| 44950.1875 | 7.92 |
| 44950.197916666664 | 7.91 |
| 44950.208333333336 | 7.9 |
| 44950.21875 | 7.9 |
| 44950.229166666664 | 7.89 |
| 44950.239583333336 | 7.89 |
| 44950.25 | 7.89 |
| 44950.260416666664 | 7.89 |
| 44950.270833333336 | 7.89 |
| 44950.28125 | 7.88 |
| 44950.291666666664 | 7.87 |
| 44950.302083333336 | 7.86 |
| 44950.3125 | 7.86 |
| 44950.322916666664 | 7.85 |
| 44950.333333333336 | 7.85 |
| 44950.34375 | 7.84 |
| 44950.354166666664 | 7.83 |
| 44950.364583333336 | 7.83 |
| 44950.375 | 7.83 |
| 44950.385416666664 | 7.84 |
| 44950.395833333336 | 7.84 |
| 44950.40625 | 7.83 |
| 44950.416666666664 | 7.84 |
| 44950.427083333336 | 7.84 |
| 44950.4375 | 7.84 |
| 44950.447916666664 | 7.85 |
| 44950.458333333336 | 7.85 |
| 44950.46875 | 7.86 |
| 44950.479166666664 | 7.86 |
| 44950.489583333336 | 7.86 |
| 44950.5 | 7.87 |
| 44950.510416666664 | 7.87 |
| 44950.520833333336 | 7.88 |
| 44950.53125 | 7.89 |
| 44950.541666666664 | 7.89 |
| 44950.552083333336 | 7.9 |
| 44950.5625 | 7.91 |
| 44950.572916666664 | 7.92 |
| 44950.583333333336 | 7.92 |
| 44950.59375 | 7.92 |
| 44950.604166666664 | 7.92 |
| 44950.614583333336 | 7.92 |
| 44950.625 | 7.92 |
| 44950.635416666664 | 7.92 |
| 44950.645833333336 | 7.92 |
| 44950.65625 | 7.92 |
| 44950.666666666664 | 7.91 |
| 44950.677083333336 | 7.92 |
| 44950.6875 | 7.93 |
| 44950.697916666664 | 7.93 |
| 44950.708333333336 | 7.94 |
| 44950.71875 | 7.94 |
| 44950.729166666664 | 7.94 |
| 44950.739583333336 | 7.94 |
| 44950.75 | 7.94 |
| 44950.760416666664 | 7.94 |
| 44950.770833333336 | 7.95 |
| 44950.78125 | 7.95 |
| 44950.791666666664 | 7.95 |
| 44950.802083333336 | 7.95 |
| 44950.8125 | 7.95 |
| 44950.822916666664 | 7.93 |
| 44950.833333333336 | 7.92 |
| 44950.84375 | 7.91 |
| 44950.854166666664 | 7.91 |
| 44950.864583333336 | 7.91 |
| 44950.875 | 7.9 |
| 44950.885416666664 | 7.9 |
| 44950.895833333336 | 7.9 |
| 44950.90625 | 7.9 |
| 44950.916666666664 | 7.91 |
| 44950.927083333336 | 7.9 |
| 44950.9375 | 7.9 |
| 44950.947916666664 | 7.9 |
| 44950.958333333336 | 7.89 |
| 44950.96875 | 7.9 |
| 44950.979166666664 | 7.91 |
| 44950.989583333336 | 7.91 |
| 44951.0 | 7.92 |
| 44951.010416666664 | 7.93 |
| 44951.020833333336 | 7.93 |
| 44951.03125 | 7.93 |
| 44951.041666666664 | 7.94 |
| 44951.052083333336 | 7.93 |
| 44951.0625 | 7.94 |
| 44951.072916666664 | 7.94 |
| 44951.083333333336 | 7.95 |
| 44951.09375 | 7.95 |
| 44951.104166666664 | 7.95 |
| 44951.114583333336 | 7.95 |
| 44951.125 | 7.95 |
| 44951.135416666664 | 7.95 |
| 44951.145833333336 | 7.95 |
| 44951.15625 | 7.95 |
| 44951.166666666664 | 7.95 |
| 44951.177083333336 | 7.94 |
| 44951.1875 | 7.94 |
| 44951.197916666664 | 7.94 |
| 44951.208333333336 | 7.94 |
| 44951.21875 | 7.93 |
| 44951.229166666664 | 7.93 |
| 44951.239583333336 | 7.91 |
| 44951.25 | 7.91 |
| 44951.260416666664 | 7.91 |
| 44951.270833333336 | 7.91 |
| 44951.28125 | 7.9 |
| 44951.291666666664 | 7.91 |
| 44951.302083333336 | 7.91 |
| 44951.3125 | 7.9 |
| 44951.322916666664 | 7.89 |
| 44951.333333333336 | 7.89 |
| 44951.34375 | 7.87 |
| 44951.354166666664 | 7.87 |
| 44951.364583333336 | 7.86 |
| 44951.375 | 7.86 |
| 44951.385416666664 | 7.85 |
| 44951.395833333336 | 7.85 |
| 44951.40625 | 7.85 |
| 44951.416666666664 | 7.85 |
| 44951.427083333336 | 7.85 |
| 44951.4375 | 7.85 |
| 44951.447916666664 | 7.85 |
| 44951.458333333336 | 7.85 |
| 44951.46875 | 7.86 |
| 44951.479166666664 | 7.86 |
| 44951.489583333336 | 7.87 |
| 44951.5 | 7.87 |
| 44951.510416666664 | 7.88 |
| 44951.520833333336 | 7.87 |
| 44951.53125 | 7.87 |
| 44951.541666666664 | 7.88 |
| 44951.552083333336 | 7.88 |
| 44951.5625 | 7.89 |
| 44951.572916666664 | 7.9 |
| 44951.583333333336 | 7.91 |
| 44951.59375 | 7.91 |
| 44951.604166666664 | 7.92 |
| 44951.614583333336 | 7.94 |
| 44951.625 | 7.94 |
| 44951.635416666664 | 7.94 |
| 44951.645833333336 | 7.94 |
| 44951.65625 | 7.93 |
| 44951.666666666664 | 7.93 |
| 44951.677083333336 | 7.93 |
| 44951.6875 | 7.93 |
| 44951.697916666664 | 7.94 |
| 44951.708333333336 | 7.93 |
| 44951.71875 | 7.94 |
| 44951.729166666664 | 7.95 |
| 44951.739583333336 | 7.95 |
| 44951.75 | 7.95 |
| 44951.760416666664 | 7.95 |
| 44951.770833333336 | 7.95 |
| 44951.78125 | 7.95 |
| 44951.791666666664 | 7.94 |
| 44951.802083333336 | 7.94 |
| 44951.8125 | 7.94 |
| 44951.822916666664 | 7.93 |
| 44951.833333333336 | 7.94 |
| 44951.84375 | 7.93 |
| 44951.854166666664 | 7.93 |
| 44951.864583333336 | 7.92 |
| 44951.875 | 7.91 |
| 44951.885416666664 | 7.91 |
| 44951.895833333336 | 7.9 |
| 44951.90625 | 7.9 |
| 44951.916666666664 | 7.9 |
| 44951.927083333336 | 7.89 |
| 44951.9375 | 7.89 |
| 44951.947916666664 | 7.89 |
| 44951.958333333336 | 7.89 |
| 44951.96875 | 7.89 |
| 44951.979166666664 | 7.89 |
| 44951.989583333336 | 7.89 |
| 44952.0 | 7.9 |
| 44952.010416666664 | 7.9 |
| 44952.020833333336 | 7.9 |
| 44952.03125 | 7.91 |
| 44952.041666666664 | 7.91 |
| 44952.052083333336 | 7.91 |
| 44952.0625 | 7.9 |
| 44952.072916666664 | 7.9 |
| 44952.083333333336 | 7.9 |
| 44952.09375 | 7.9 |
| 44952.104166666664 | 7.91 |
| 44952.114583333336 | 7.91 |
| 44952.125 | 7.92 |
| 44952.135416666664 | 7.92 |
| 44952.145833333336 | 7.92 |
| 44952.15625 | 7.92 |
| 44952.166666666664 | 7.92 |
| 44952.177083333336 | 7.92 |
| 44952.1875 | 7.92 |
| 44952.197916666664 | 7.92 |
| 44952.208333333336 | 7.92 |
| 44952.21875 | 7.91 |
| 44952.229166666664 | 7.9 |
| 44952.239583333336 | 7.91 |
| 44952.25 | 7.91 |
| 44952.260416666664 | 7.9 |
| 44952.270833333336 | 7.89 |
| 44952.28125 | 7.88 |
| 44952.291666666664 | 7.86 |
| 44952.302083333336 | 7.86 |
| 44952.3125 | 7.84 |
| 44952.322916666664 | 7.83 |
| 44952.333333333336 | 7.84 |
| 44952.34375 | 7.82 |
| 44952.354166666664 | 7.84 |
| 44952.364583333336 | 7.84 |
| 44952.375 | 7.84 |
| 44952.385416666664 | 7.84 |
| 44952.395833333336 | 7.82 |
| 44952.40625 | 7.82 |
| 44952.416666666664 | 7.82 |
| 44952.427083333336 | 7.81 |
| 44952.4375 | 7.8 |
| 44952.447916666664 | 7.79 |
| 44952.458333333336 | 7.78 |
| 44952.46875 | 7.78 |
| 44952.479166666664 | 7.78 |
| 44952.489583333336 | 7.79 |
| 44952.5 | 7.79 |
| 44952.510416666664 | 7.8 |
| 44952.520833333336 | 7.82 |
| 44952.53125 | 7.82 |
| 44952.541666666664 | 7.83 |
| 44952.552083333336 | 7.83 |
| 44952.5625 | 7.83 |
| 44952.572916666664 | 7.84 |
| 44952.583333333336 | 7.84 |
| 44952.59375 | 7.84 |
| 44952.604166666664 | 7.85 |
| 44952.614583333336 | 7.85 |
| 44952.625 | 7.85 |
| 44952.635416666664 | 7.86 |
| 44952.645833333336 | 7.87 |
| 44952.65625 | 7.88 |
| 44952.666666666664 | 7.89 |
| 44952.677083333336 | 7.89 |
| 44952.6875 | 7.89 |
| 44952.697916666664 | 7.9 |
| 44952.708333333336 | 7.9 |
| 44952.71875 | 7.9 |
| 44952.729166666664 | 7.9 |
| 44952.739583333336 | 7.9 |
| 44952.75 | 7.9 |
| 44952.760416666664 | 7.91 |
| 44952.770833333336 | 7.91 |
| 44952.78125 | 7.91 |
| 44952.791666666664 | 7.91 |
| 44952.802083333336 | 7.91 |
| 44952.8125 | 7.91 |
| 44952.822916666664 | 7.91 |
| 44952.833333333336 | 7.91 |
| 44952.84375 | 7.91 |
| 44952.854166666664 | 7.91 |
| 44952.864583333336 | 7.91 |
| 44952.875 | 7.91 |
| 44952.885416666664 | 7.89 |
| 44952.895833333336 | 7.87 |
| 44952.90625 | 7.86 |
| 44952.916666666664 | 7.86 |
| 44952.927083333336 | 7.85 |
| 44952.9375 | 7.85 |
| 44952.947916666664 | 7.85 |
| 44952.958333333336 | 7.84 |
| 44952.96875 | 7.83 |
| 44952.979166666664 | 7.83 |
| 44952.989583333336 | 7.84 |
| 44953.0 | 7.83 |
| 44953.010416666664 | 7.83 |
| 44953.020833333336 | 7.83 |
| 44953.03125 | 7.83 |
| 44953.041666666664 | 7.85 |
| 44953.052083333336 | 7.87 |
| 44953.0625 | 7.87 |
| 44953.072916666664 | 7.87 |
| 44953.083333333336 | 7.87 |
| 44953.09375 | 7.88 |
| 44953.104166666664 | 7.88 |
| 44953.114583333336 | 7.87 |
| 44953.125 | 7.87 |
| 44953.135416666664 | 7.87 |
| 44953.145833333336 | 7.88 |
| 44953.15625 | 7.88 |
| 44953.166666666664 | 7.89 |
| 44953.177083333336 | 7.9 |
| 44953.1875 | 7.9 |
| 44953.197916666664 | 7.91 |
| 44953.208333333336 | 7.91 |
| 44953.21875 | 7.91 |
| 44953.229166666664 | 7.91 |
| 44953.239583333336 | 7.91 |
| 44953.25 | 7.91 |
| 44953.260416666664 | 7.91 |
| 44953.270833333336 | 7.91 |
| 44953.28125 | 7.9 |
| 44953.291666666664 | 7.9 |
| 44953.302083333336 | 7.9 |
| 44953.3125 | 7.9 |
| 44953.322916666664 | 7.86 |
| 44953.333333333336 | 7.86 |
| 44953.34375 | 7.85 |
| 44953.354166666664 | 7.86 |
| 44953.364583333336 | 7.84 |
| 44953.375 | 7.86 |
| 44953.385416666664 | 7.84 |
| 44953.395833333336 | 7.83 |
| 44953.40625 | 7.82 |
| 44953.416666666664 | 7.81 |
| 44953.427083333336 | 7.8 |
| 44953.4375 | 7.79 |
| 44953.447916666664 | 7.78 |
| 44953.458333333336 | 7.76 |
| 44953.46875 | 7.76 |
| 44953.479166666664 | 7.76 |
| 44953.489583333336 | 7.75 |
| 44953.5 | 7.75 |
| 44953.510416666664 | 7.75 |
| 44953.520833333336 | 7.75 |
| 44953.53125 | 7.74 |
| 44953.541666666664 | 7.75 |
| 44953.552083333336 | 7.75 |
| 44953.5625 | 7.76 |
| 44953.572916666664 | 7.79 |
| 44953.583333333336 | 7.8 |
| 44953.59375 | 7.82 |
| 44953.604166666664 | 7.82 |
| 44953.614583333336 | 7.83 |
| 44953.625 | 7.84 |
| 44953.635416666664 | 7.85 |
| 44953.645833333336 | 7.85 |
| 44953.65625 | 7.86 |
| 44953.666666666664 | 7.87 |
| 44953.677083333336 | 7.88 |
| 44953.6875 | 7.89 |
| 44953.697916666664 | 7.9 |
| 44953.708333333336 | 7.91 |
| 44953.71875 | 7.91 |
| 44953.729166666664 | 7.92 |
| 44953.739583333336 | 7.92 |
| 44953.75 | 7.93 |
| 44953.760416666664 | 7.93 |
| 44953.770833333336 | 7.93 |
| 44953.78125 | 7.93 |
| 44953.791666666664 | 7.94 |
| 44953.802083333336 | 7.94 |
| 44953.8125 | 7.95 |
| 44953.822916666664 | 7.94 |
| 44953.833333333336 | 7.94 |
| 44953.84375 | 7.93 |
| 44953.854166666664 | 7.94 |
| 44953.864583333336 | 7.91 |
| 44953.875 | 7.9 |
| 44953.885416666664 | 7.89 |
| 44953.895833333336 | 7.88 |
| 44953.90625 | 7.88 |
| 44953.916666666664 | 7.87 |
| 44953.927083333336 | 7.87 |
| 44953.9375 | 7.86 |
| 44953.947916666664 | 7.86 |
| 44953.958333333336 | 7.86 |
| 44953.96875 | 7.85 |
| 44953.979166666664 | 7.85 |
| 44953.989583333336 | 7.85 |
| 44954.0 | 7.85 |
| 44954.010416666664 | 7.85 |
| 44954.020833333336 | 7.85 |
| 44954.03125 | 7.84 |
| 44954.041666666664 | 7.83 |
| 44954.052083333336 | 7.84 |
| 44954.0625 | 7.84 |
| 44954.072916666664 | 7.86 |
| 44954.083333333336 | 7.87 |
| 44954.09375 | 7.88 |
| 44954.104166666664 | 7.89 |
| 44954.114583333336 | 7.9 |
| 44954.125 | 7.89 |
| 44954.135416666664 | 7.9 |
| 44954.145833333336 | 7.9 |
| 44954.15625 | 7.9 |
| 44954.166666666664 | 7.91 |
| 44954.177083333336 | 7.91 |
| 44954.1875 | 7.92 |
| 44954.197916666664 | 7.92 |
| 44954.208333333336 | 7.93 |
| 44954.21875 | 7.93 |
| 44954.229166666664 | 7.93 |
| 44954.239583333336 | 7.93 |
| 44954.25 | 7.93 |
| 44954.260416666664 | 7.93 |
| 44954.270833333336 | 7.93 |
| 44954.28125 | 7.93 |
| 44954.291666666664 | 7.93 |
| 44954.302083333336 | 7.93 |
| 44954.3125 | 7.92 |
| 44954.322916666664 | 7.92 |
| 44954.333333333336 | 7.92 |
| 44954.34375 | 7.92 |
| 44954.354166666664 | 7.91 |
| 44954.364583333336 | 7.9 |
| 44954.375 | 7.91 |
| 44954.385416666664 | 7.88 |
| 44954.395833333336 | 7.9 |
| 44954.40625 | 7.9 |
| 44954.416666666664 | 7.89 |
| 44954.427083333336 | 7.88 |
| 44954.4375 | 7.87 |
| 44954.447916666664 | 7.86 |
| 44954.458333333336 | 7.85 |
| 44954.46875 | 7.84 |
| 44954.479166666664 | 7.84 |
| 44954.489583333336 | 7.83 |
| 44954.5 | 7.82 |
| 44954.510416666664 | 7.82 |
| 44954.520833333336 | 7.81 |
| 44954.53125 | 7.81 |
| 44954.541666666664 | 7.81 |
| 44954.552083333336 | 7.81 |
| 44954.5625 | 7.82 |
| 44954.572916666664 | 7.82 |
| 44954.583333333336 | 7.83 |
| 44954.59375 | 7.84 |
| 44954.604166666664 | 7.85 |
| 44954.614583333336 | 7.86 |
| 44954.625 | 7.87 |
| 44954.635416666664 | 7.88 |
| 44954.645833333336 | 7.89 |
| 44954.65625 | 7.9 |
| 44954.666666666664 | 7.9 |
| 44954.677083333336 | 7.91 |
| 44954.6875 | 7.91 |
| 44954.697916666664 | 7.92 |
| 44954.708333333336 | 7.92 |
| 44954.71875 | 7.93 |
| 44954.729166666664 | 7.93 |
| 44954.739583333336 | 7.93 |
| 44954.75 | 7.94 |
| 44954.760416666664 | 7.94 |
| 44954.770833333336 | 7.95 |
| 44954.78125 | 7.95 |
| 44954.791666666664 | 7.95 |
| 44954.802083333336 | 7.95 |
| 44954.8125 | 7.96 |
| 44954.822916666664 | 7.96 |
| 44954.833333333336 | 7.97 |
| 44954.84375 | 7.98 |
| 44954.854166666664 | 7.99 |
| 44954.864583333336 | 7.99 |
| 44954.875 | 7.99 |
| 44954.885416666664 | 7.98 |
| 44954.895833333336 | 7.96 |
| 44954.90625 | 7.95 |
| 44954.916666666664 | 7.94 |
| 44954.927083333336 | 7.93 |
| 44954.9375 | 7.93 |
| 44954.947916666664 | 7.93 |
| 44954.958333333336 | 7.93 |
| 44954.96875 | 7.92 |
| 44954.979166666664 | 7.92 |
| 44954.989583333336 | 7.91 |
| 44955.0 | 7.91 |
| 44955.010416666664 | 7.91 |
| 44955.020833333336 | 7.9 |
| 44955.03125 | 7.9 |
| 44955.041666666664 | 7.9 |
| 44955.052083333336 | 7.9 |
| 44955.0625 | 7.9 |
| 44955.072916666664 | 7.89 |
| 44955.083333333336 | 7.89 |
| 44955.09375 | 7.89 |
| 44955.104166666664 | 7.9 |
| 44955.114583333336 | 7.91 |
| 44955.125 | 7.91 |
| 44955.135416666664 | 7.92 |
| 44955.145833333336 | 7.93 |
| 44955.15625 | 7.93 |
| 44955.166666666664 | 7.93 |
| 44955.177083333336 | 7.93 |
| 44955.1875 | 7.92 |
| 44955.197916666664 | 7.92 |
| 44955.208333333336 | 7.92 |
| 44955.21875 | 7.92 |
| 44955.229166666664 | 7.93 |
| 44955.239583333336 | 7.93 |
| 44955.25 | 7.93 |
| 44955.260416666664 | 7.93 |
| 44955.270833333336 | 7.93 |
| 44955.28125 | 7.93 |
| 44955.291666666664 | 7.94 |
| 44955.302083333336 | 7.93 |
| 44955.3125 | 7.94 |
| 44955.322916666664 | 7.93 |
| 44955.333333333336 | 7.93 |
| 44955.34375 | 7.93 |
| 44955.354166666664 | 7.93 |
| 44955.364583333336 | 7.93 |
| 44955.375 | 7.92 |
| 44955.385416666664 | 7.92 |
| 44955.395833333336 | 7.92 |
| 44955.40625 | 7.92 |
| 44955.416666666664 | 7.9 |
| 44955.427083333336 | 7.9 |
| 44955.4375 | 7.89 |
| 44955.447916666664 | 7.9 |
| 44955.458333333336 | 7.9 |
| 44955.46875 | 7.91 |
| 44955.479166666664 | 7.9 |
| 44955.489583333336 | 7.89 |
| 44955.5 | 7.88 |
| 44955.510416666664 | 7.88 |
| 44955.520833333336 | 7.87 |
| 44955.53125 | 7.86 |
| 44955.541666666664 | 7.86 |
| 44955.552083333336 | 7.85 |
| 44955.5625 | 7.85 |
| 44955.572916666664 | 7.85 |
| 44955.583333333336 | 7.86 |
| 44955.59375 | 7.86 |
| 44955.604166666664 | 7.86 |
| 44955.614583333336 | 7.87 |
| 44955.625 | 7.87 |
| 44955.635416666664 | 7.88 |
| 44955.645833333336 | 7.89 |
| 44955.65625 | 7.9 |
| 44955.666666666664 | 7.91 |
| 44955.677083333336 | 7.92 |
| 44955.6875 | 7.92 |
| 44955.697916666664 | 7.93 |
| 44955.708333333336 | 7.93 |
| 44955.71875 | 7.94 |
| 44955.729166666664 | 7.94 |
| 44955.739583333336 | 7.95 |
| 44955.75 | 7.95 |
| 44955.760416666664 | 7.95 |
| 44955.770833333336 | 7.95 |
| 44955.78125 | 7.95 |
| 44955.791666666664 | 7.95 |
| 44955.802083333336 | 7.96 |
| 44955.8125 | 7.96 |
| 44955.822916666664 | 7.96 |
| 44955.833333333336 | 7.96 |
| 44955.84375 | 7.97 |
| 44955.854166666664 | 7.97 |
| 44955.864583333336 | 7.97 |
| 44955.875 | 7.98 |
| 44955.885416666664 | 7.98 |
| 44955.895833333336 | 7.98 |
| 44955.90625 | 7.98 |
| 44955.916666666664 | 7.99 |
| 44955.927083333336 | 7.99 |
| 44955.9375 | 7.98 |
| 44955.947916666664 | 7.98 |
| 44955.958333333336 | 7.96 |
| 44955.96875 | 7.97 |
| 44955.979166666664 | 7.96 |
| 44955.989583333336 | 7.95 |
| 44956.0 | 7.95 |
| 44956.010416666664 | 7.95 |
| 44956.020833333336 | 7.95 |
| 44956.03125 | 7.94 |
| 44956.041666666664 | 7.94 |
| 44956.052083333336 | 7.94 |
| 44956.0625 | 7.94 |
| 44956.072916666664 | 7.94 |
| 44956.083333333336 | 7.93 |
| 44956.09375 | 7.94 |
| 44956.104166666664 | 7.93 |
| 44956.114583333336 | 7.93 |
| 44956.125 | 7.93 |
| 44956.135416666664 | 7.93 |
| 44956.145833333336 | 7.94 |
| 44956.15625 | 7.94 |
| 44956.166666666664 | 7.94 |
| 44956.177083333336 | 7.94 |
| 44956.1875 | 7.94 |
| 44956.197916666664 | 7.94 |
| 44956.208333333336 | 7.93 |
| 44956.21875 | 7.93 |
| 44956.229166666664 | 7.93 |
| 44956.239583333336 | 7.93 |
| 44956.25 | 7.93 |
| 44956.260416666664 | 7.92 |
| 44956.270833333336 | 7.92 |
| 44956.28125 | 7.92 |
| 44956.291666666664 | 7.92 |
| 44956.302083333336 | 7.93 |
| 44956.3125 | 7.93 |
| 44956.322916666664 | 7.93 |
| 44956.333333333336 | 7.93 |
| 44956.34375 | 7.93 |
| 44956.354166666664 | 7.93 |
| 44956.364583333336 | 7.93 |
| 44956.375 | 7.93 |
| 44956.385416666664 | 7.92 |
| 44956.395833333336 | 7.92 |
| 44956.40625 | 7.92 |
| 44956.416666666664 | 7.92 |
| 44956.427083333336 | 7.92 |
| 44956.4375 | 7.91 |
| 44956.447916666664 | 7.92 |
| 44956.458333333336 | 7.91 |
| 44956.46875 | 7.9 |
| 44956.479166666664 | 7.89 |
| 44956.489583333336 | 7.87 |
| 44956.5 | 7.88 |
| 44956.510416666664 | 7.88 |
| 44956.520833333336 | 7.88 |
| 44956.53125 | 7.88 |
| 44956.541666666664 | 7.89 |
| 44956.552083333336 | 7.88 |
| 44956.5625 | 7.87 |
| 44956.572916666664 | 7.87 |
| 44956.583333333336 | 7.86 |
| 44956.59375 | 7.86 |
| 44956.604166666664 | 7.85 |
| 44956.614583333336 | 7.85 |
| 44956.625 | 7.85 |
| 44956.635416666664 | 7.85 |
| 44956.645833333336 | 7.86 |
| 44956.65625 | 7.86 |
| 44956.666666666664 | 7.86 |
| 44956.677083333336 | 7.87 |
| 44956.6875 | 7.87 |
| 44956.697916666664 | 7.87 |
| 44956.708333333336 | 7.89 |
| 44956.71875 | 7.89 |
| 44956.729166666664 | 7.9 |
| 44956.739583333336 | 7.9 |
| 44956.75 | 7.91 |
| 44956.760416666664 | 7.92 |
| 44956.770833333336 | 7.92 |
| 44956.78125 | 7.93 |
| 44956.791666666664 | 7.94 |
| 44956.802083333336 | 7.94 |
| 44956.8125 | 7.94 |
| 44956.822916666664 | 7.95 |
| 44956.833333333336 | 7.95 |
| 44956.84375 | 7.95 |
| 44956.854166666664 | 7.95 |
| 44956.864583333336 | 7.95 |
| 44956.875 | 7.96 |
| 44956.885416666664 | 7.96 |
| 44956.895833333336 | 7.95 |
| 44956.90625 | 7.96 |
| 44956.916666666664 | 7.96 |
| 44956.927083333336 | 7.97 |
| 44956.9375 | 7.98 |
| 44956.947916666664 | 7.98 |
| 44956.958333333336 | 7.99 |
| 44956.96875 | 7.99 |
| 44956.979166666664 | 7.99 |
| 44956.989583333336 | 7.98 |
| 44957.0 | 7.97 |
| 44957.010416666664 | 7.96 |
| 44957.020833333336 | 7.95 |
| 44957.03125 | 7.94 |
| 44957.041666666664 | 7.93 |
| 44957.052083333336 | 7.92 |
| 44957.0625 | 7.92 |
| 44957.072916666664 | 7.92 |
| 44957.083333333336 | 7.92 |
| 44957.09375 | 7.92 |
| 44957.104166666664 | 7.92 |
| 44957.114583333336 | 7.92 |
| 44957.125 | 7.92 |
| 44957.135416666664 | 7.91 |
| 44957.145833333336 | 7.91 |
| 44957.15625 | 7.91 |
| 44957.166666666664 | 7.92 |
| 44957.177083333336 | 7.92 |
| 44957.1875 | 7.93 |
| 44957.197916666664 | 7.93 |
| 44957.208333333336 | 7.93 |
| 44957.21875 | 7.93 |
| 44957.229166666664 | 7.93 |
| 44957.239583333336 | 7.93 |
| 44957.25 | 7.93 |
| 44957.260416666664 | 7.93 |
| 44957.270833333336 | 7.92 |
| 44957.28125 | 7.92 |
| 44957.291666666664 | 7.92 |
| 44957.302083333336 | 7.91 |
| 44957.3125 | 7.91 |
| 44957.322916666664 | 7.92 |
| 44957.333333333336 | 7.92 |
| 44957.34375 | 7.92 |
| 44957.354166666664 | 7.92 |
| 44957.364583333336 | 7.92 |
| 44957.375 | 7.92 |
| 44957.385416666664 | 7.92 |
| 44957.395833333336 | 7.92 |
| 44957.40625 | 7.92 |
| 44957.416666666664 | 7.92 |
| 44957.427083333336 | 7.91 |
| 44957.4375 | 7.92 |
| 44957.447916666664 | 7.92 |
| 44957.458333333336 | 7.91 |
| 44957.46875 | 7.91 |
| 44957.479166666664 | 7.9 |
| 44957.489583333336 | 7.9 |
| 44957.5 | 7.9 |
| 44957.510416666664 | 7.88 |
| 44957.520833333336 | 7.87 |
| 44957.53125 | 7.86 |
| 44957.541666666664 | 7.85 |
| 44957.552083333336 | 7.88 |
| 44957.5625 | 7.89 |
| 44957.572916666664 | 7.88 |
| 44957.583333333336 | 7.87 |
| 44957.59375 | 7.87 |
| 44957.604166666664 | 7.86 |
| 44957.614583333336 | 7.86 |
| 44957.625 | 7.86 |
| 44957.635416666664 | 7.86 |
| 44957.645833333336 | 7.86 |
| 44957.65625 | 7.86 |
| 44957.666666666664 | 7.86 |
| 44957.677083333336 | 7.86 |
| 44957.6875 | 7.87 |
| 44957.697916666664 | 7.87 |
| 44957.708333333336 | 7.87 |
| 44957.71875 | 7.87 |
| 44957.729166666664 | 7.87 |
| 44957.739583333336 | 7.87 |
| 44957.75 | 7.87 |
| 44957.760416666664 | 7.88 |
| 44957.770833333336 | 7.88 |
| 44957.78125 | 7.89 |
| 44957.791666666664 | 7.91 |
| 44957.802083333336 | 7.92 |
| 44957.8125 | 7.92 |
| 44957.822916666664 | 7.93 |
| 44957.833333333336 | 7.93 |
| 44957.84375 | 7.93 |
| 44957.854166666664 | 7.93 |
| 44957.864583333336 | 7.94 |
| 44957.875 | 7.94 |
| 44957.885416666664 | 7.94 |
| 44957.895833333336 | 7.93 |
| 44957.90625 | 7.93 |
| 44957.916666666664 | 7.93 |
| 44957.927083333336 | 7.93 |
| 44957.9375 | 7.93 |
| 44957.947916666664 | 7.94 |
| 44957.958333333336 | 7.94 |
| 44957.96875 | 7.94 |
| 44957.979166666664 | 7.93 |
| 44957.989583333336 | 7.92 |
| 44958.0 | 7.91 |
| 44958.010416666664 | 7.91 |
| 44958.020833333336 | 7.9 |
| 44958.03125 | 7.9 |
| 44958.041666666664 | 7.9 |
| 44958.052083333336 | 7.89 |
| 44958.0625 | 7.89 |
| 44958.072916666664 | 7.89 |
| 44958.083333333336 | 7.9 |
| 44958.09375 | 7.9 |
| 44958.104166666664 | 7.91 |
| 44958.114583333336 | 7.9 |
| 44958.125 | 7.89 |
| 44958.135416666664 | 7.89 |
| 44958.145833333336 | 7.89 |